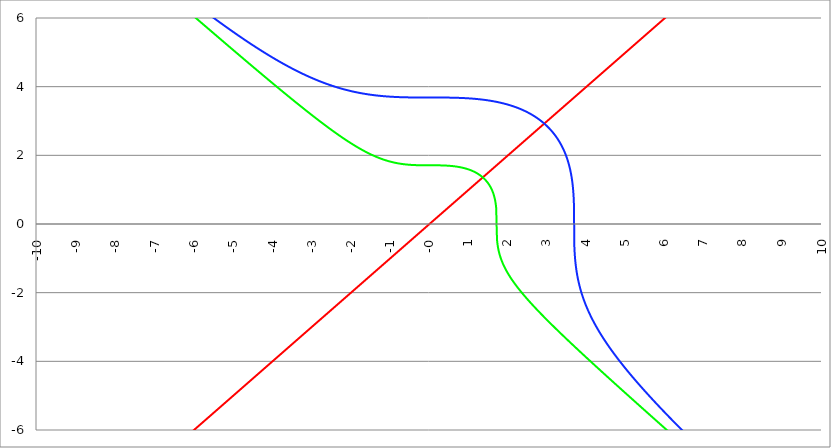
| Category | Series 1 | Series 0 | Series 2 |
|---|---|---|---|
| -10.0 | -10 | 10.017 | 10.164 |
| -9.99 | -9.99 | 10.007 | 10.154 |
| -9.98 | -9.98 | 9.997 | 10.145 |
| -9.97 | -9.97 | 9.987 | 10.135 |
| -9.96 | -9.96 | 9.977 | 10.125 |
| -9.95 | -9.95 | 9.967 | 10.116 |
| -9.940000000000001 | -9.94 | 9.957 | 10.106 |
| -9.930000000000001 | -9.93 | 9.947 | 10.096 |
| -9.920000000000002 | -9.92 | 9.937 | 10.087 |
| -9.91 | -9.91 | 9.927 | 10.077 |
| -9.900000000000002 | -9.9 | 9.917 | 10.067 |
| -9.890000000000002 | -9.89 | 9.907 | 10.058 |
| -9.880000000000003 | -9.88 | 9.897 | 10.048 |
| -9.870000000000003 | -9.87 | 9.887 | 10.038 |
| -9.860000000000001 | -9.86 | 9.877 | 10.029 |
| -9.850000000000003 | -9.85 | 9.867 | 10.019 |
| -9.840000000000003 | -9.84 | 9.857 | 10.009 |
| -9.830000000000004 | -9.83 | 9.847 | 10 |
| -9.820000000000004 | -9.82 | 9.837 | 9.99 |
| -9.810000000000004 | -9.81 | 9.827 | 9.98 |
| -9.800000000000004 | -9.8 | 9.817 | 9.971 |
| -9.790000000000004 | -9.79 | 9.807 | 9.961 |
| -9.780000000000005 | -9.78 | 9.797 | 9.951 |
| -9.770000000000005 | -9.77 | 9.787 | 9.942 |
| -9.760000000000005 | -9.76 | 9.777 | 9.932 |
| -9.750000000000005 | -9.75 | 9.768 | 9.922 |
| -9.740000000000006 | -9.74 | 9.758 | 9.913 |
| -9.730000000000006 | -9.73 | 9.748 | 9.903 |
| -9.720000000000006 | -9.72 | 9.738 | 9.893 |
| -9.710000000000006 | -9.71 | 9.728 | 9.884 |
| -9.700000000000006 | -9.7 | 9.718 | 9.874 |
| -9.690000000000007 | -9.69 | 9.708 | 9.864 |
| -9.680000000000007 | -9.68 | 9.698 | 9.855 |
| -9.670000000000007 | -9.67 | 9.688 | 9.845 |
| -9.660000000000007 | -9.66 | 9.678 | 9.835 |
| -9.650000000000007 | -9.65 | 9.668 | 9.826 |
| -9.640000000000008 | -9.64 | 9.658 | 9.816 |
| -9.630000000000008 | -9.63 | 9.648 | 9.806 |
| -9.620000000000008 | -9.62 | 9.638 | 9.797 |
| -9.610000000000008 | -9.61 | 9.628 | 9.787 |
| -9.600000000000009 | -9.6 | 9.618 | 9.778 |
| -9.590000000000009 | -9.59 | 9.608 | 9.768 |
| -9.580000000000007 | -9.58 | 9.598 | 9.758 |
| -9.57000000000001 | -9.57 | 9.588 | 9.749 |
| -9.56000000000001 | -9.56 | 9.578 | 9.739 |
| -9.55000000000001 | -9.55 | 9.568 | 9.729 |
| -9.54000000000001 | -9.54 | 9.558 | 9.72 |
| -9.53000000000001 | -9.53 | 9.548 | 9.71 |
| -9.52000000000001 | -9.52 | 9.538 | 9.7 |
| -9.51000000000001 | -9.51 | 9.528 | 9.691 |
| -9.50000000000001 | -9.5 | 9.518 | 9.681 |
| -9.49000000000001 | -9.49 | 9.508 | 9.672 |
| -9.48000000000001 | -9.48 | 9.499 | 9.662 |
| -9.47000000000001 | -9.47 | 9.489 | 9.652 |
| -9.46000000000001 | -9.46 | 9.479 | 9.643 |
| -9.45000000000001 | -9.45 | 9.469 | 9.633 |
| -9.44000000000001 | -9.44 | 9.459 | 9.623 |
| -9.430000000000012 | -9.43 | 9.449 | 9.614 |
| -9.420000000000012 | -9.42 | 9.439 | 9.604 |
| -9.410000000000013 | -9.41 | 9.429 | 9.595 |
| -9.400000000000013 | -9.4 | 9.419 | 9.585 |
| -9.390000000000011 | -9.39 | 9.409 | 9.575 |
| -9.380000000000013 | -9.38 | 9.399 | 9.566 |
| -9.370000000000013 | -9.37 | 9.389 | 9.556 |
| -9.360000000000014 | -9.36 | 9.379 | 9.546 |
| -9.350000000000014 | -9.35 | 9.369 | 9.537 |
| -9.340000000000014 | -9.34 | 9.359 | 9.527 |
| -9.330000000000014 | -9.33 | 9.349 | 9.518 |
| -9.320000000000014 | -9.32 | 9.339 | 9.508 |
| -9.310000000000015 | -9.31 | 9.329 | 9.498 |
| -9.300000000000013 | -9.3 | 9.319 | 9.489 |
| -9.290000000000015 | -9.29 | 9.309 | 9.479 |
| -9.280000000000015 | -9.28 | 9.299 | 9.47 |
| -9.270000000000016 | -9.27 | 9.289 | 9.46 |
| -9.260000000000016 | -9.26 | 9.279 | 9.45 |
| -9.250000000000014 | -9.25 | 9.269 | 9.441 |
| -9.240000000000016 | -9.24 | 9.259 | 9.431 |
| -9.230000000000016 | -9.23 | 9.25 | 9.422 |
| -9.220000000000017 | -9.22 | 9.24 | 9.412 |
| -9.210000000000017 | -9.21 | 9.23 | 9.402 |
| -9.200000000000017 | -9.2 | 9.22 | 9.393 |
| -9.190000000000017 | -9.19 | 9.21 | 9.383 |
| -9.180000000000017 | -9.18 | 9.2 | 9.374 |
| -9.170000000000018 | -9.17 | 9.19 | 9.364 |
| -9.160000000000016 | -9.16 | 9.18 | 9.354 |
| -9.150000000000018 | -9.15 | 9.17 | 9.345 |
| -9.140000000000018 | -9.14 | 9.16 | 9.335 |
| -9.130000000000019 | -9.13 | 9.15 | 9.326 |
| -9.120000000000019 | -9.12 | 9.14 | 9.316 |
| -9.110000000000017 | -9.11 | 9.13 | 9.307 |
| -9.10000000000002 | -9.1 | 9.12 | 9.297 |
| -9.09000000000002 | -9.09 | 9.11 | 9.287 |
| -9.08000000000002 | -9.08 | 9.1 | 9.278 |
| -9.07000000000002 | -9.07 | 9.09 | 9.268 |
| -9.06000000000002 | -9.06 | 9.08 | 9.259 |
| -9.05000000000002 | -9.05 | 9.07 | 9.249 |
| -9.04000000000002 | -9.04 | 9.06 | 9.24 |
| -9.03000000000002 | -9.03 | 9.05 | 9.23 |
| -9.020000000000021 | -9.02 | 9.04 | 9.22 |
| -9.010000000000021 | -9.01 | 9.03 | 9.211 |
| -9.000000000000021 | -9 | 9.021 | 9.201 |
| -8.990000000000022 | -8.99 | 9.011 | 9.192 |
| -8.980000000000022 | -8.98 | 9.001 | 9.182 |
| -8.97000000000002 | -8.97 | 8.991 | 9.173 |
| -8.960000000000022 | -8.96 | 8.981 | 9.163 |
| -8.950000000000022 | -8.95 | 8.971 | 9.153 |
| -8.940000000000023 | -8.94 | 8.961 | 9.144 |
| -8.930000000000023 | -8.93 | 8.951 | 9.134 |
| -8.920000000000023 | -8.92 | 8.941 | 9.125 |
| -8.910000000000023 | -8.91 | 8.931 | 9.115 |
| -8.900000000000023 | -8.9 | 8.921 | 9.106 |
| -8.890000000000024 | -8.89 | 8.911 | 9.096 |
| -8.880000000000024 | -8.88 | 8.901 | 9.087 |
| -8.870000000000024 | -8.87 | 8.891 | 9.077 |
| -8.860000000000024 | -8.86 | 8.881 | 9.067 |
| -8.850000000000025 | -8.85 | 8.871 | 9.058 |
| -8.840000000000025 | -8.84 | 8.861 | 9.048 |
| -8.830000000000025 | -8.83 | 8.851 | 9.039 |
| -8.820000000000025 | -8.82 | 8.841 | 9.029 |
| -8.810000000000025 | -8.81 | 8.831 | 9.02 |
| -8.800000000000026 | -8.8 | 8.821 | 9.01 |
| -8.790000000000026 | -8.79 | 8.812 | 9.001 |
| -8.780000000000026 | -8.78 | 8.802 | 8.991 |
| -8.770000000000026 | -8.77 | 8.792 | 8.982 |
| -8.760000000000026 | -8.76 | 8.782 | 8.972 |
| -8.750000000000027 | -8.75 | 8.772 | 8.962 |
| -8.740000000000027 | -8.74 | 8.762 | 8.953 |
| -8.730000000000027 | -8.73 | 8.752 | 8.943 |
| -8.720000000000027 | -8.72 | 8.742 | 8.934 |
| -8.710000000000027 | -8.71 | 8.732 | 8.924 |
| -8.700000000000028 | -8.7 | 8.722 | 8.915 |
| -8.690000000000028 | -8.69 | 8.712 | 8.905 |
| -8.680000000000028 | -8.68 | 8.702 | 8.896 |
| -8.670000000000028 | -8.67 | 8.692 | 8.886 |
| -8.660000000000029 | -8.66 | 8.682 | 8.877 |
| -8.650000000000029 | -8.65 | 8.672 | 8.867 |
| -8.640000000000029 | -8.64 | 8.662 | 8.858 |
| -8.63000000000003 | -8.63 | 8.652 | 8.848 |
| -8.62000000000003 | -8.62 | 8.642 | 8.839 |
| -8.61000000000003 | -8.61 | 8.632 | 8.829 |
| -8.60000000000003 | -8.6 | 8.622 | 8.82 |
| -8.59000000000003 | -8.59 | 8.613 | 8.81 |
| -8.58000000000003 | -8.58 | 8.603 | 8.801 |
| -8.57000000000003 | -8.57 | 8.593 | 8.791 |
| -8.56000000000003 | -8.56 | 8.583 | 8.782 |
| -8.55000000000003 | -8.55 | 8.573 | 8.772 |
| -8.540000000000031 | -8.54 | 8.563 | 8.763 |
| -8.530000000000031 | -8.53 | 8.553 | 8.753 |
| -8.520000000000032 | -8.52 | 8.543 | 8.744 |
| -8.510000000000032 | -8.51 | 8.533 | 8.734 |
| -8.50000000000003 | -8.5 | 8.523 | 8.725 |
| -8.490000000000032 | -8.49 | 8.513 | 8.715 |
| -8.480000000000032 | -8.48 | 8.503 | 8.706 |
| -8.470000000000033 | -8.47 | 8.493 | 8.696 |
| -8.460000000000033 | -8.46 | 8.483 | 8.687 |
| -8.450000000000033 | -8.45 | 8.473 | 8.677 |
| -8.440000000000033 | -8.44 | 8.463 | 8.668 |
| -8.430000000000033 | -8.43 | 8.453 | 8.658 |
| -8.420000000000034 | -8.42 | 8.443 | 8.649 |
| -8.410000000000032 | -8.41 | 8.433 | 8.639 |
| -8.400000000000034 | -8.4 | 8.424 | 8.63 |
| -8.390000000000034 | -8.39 | 8.414 | 8.62 |
| -8.380000000000035 | -8.38 | 8.404 | 8.611 |
| -8.370000000000035 | -8.37 | 8.394 | 8.601 |
| -8.360000000000033 | -8.36 | 8.384 | 8.592 |
| -8.350000000000035 | -8.35 | 8.374 | 8.583 |
| -8.340000000000035 | -8.34 | 8.364 | 8.573 |
| -8.330000000000036 | -8.33 | 8.354 | 8.564 |
| -8.320000000000036 | -8.32 | 8.344 | 8.554 |
| -8.310000000000034 | -8.31 | 8.334 | 8.545 |
| -8.300000000000036 | -8.3 | 8.324 | 8.535 |
| -8.290000000000036 | -8.29 | 8.314 | 8.526 |
| -8.280000000000037 | -8.28 | 8.304 | 8.516 |
| -8.270000000000037 | -8.27 | 8.294 | 8.507 |
| -8.260000000000037 | -8.26 | 8.284 | 8.497 |
| -8.250000000000037 | -8.25 | 8.274 | 8.488 |
| -8.240000000000038 | -8.24 | 8.264 | 8.478 |
| -8.230000000000038 | -8.23 | 8.255 | 8.469 |
| -8.220000000000038 | -8.22 | 8.245 | 8.46 |
| -8.210000000000038 | -8.21 | 8.235 | 8.45 |
| -8.200000000000038 | -8.2 | 8.225 | 8.441 |
| -8.190000000000039 | -8.19 | 8.215 | 8.431 |
| -8.180000000000039 | -8.18 | 8.205 | 8.422 |
| -8.170000000000037 | -8.17 | 8.195 | 8.412 |
| -8.16000000000004 | -8.16 | 8.185 | 8.403 |
| -8.15000000000004 | -8.15 | 8.175 | 8.394 |
| -8.14000000000004 | -8.14 | 8.165 | 8.384 |
| -8.13000000000004 | -8.13 | 8.155 | 8.375 |
| -8.12000000000004 | -8.12 | 8.145 | 8.365 |
| -8.11000000000004 | -8.11 | 8.135 | 8.356 |
| -8.10000000000004 | -8.1 | 8.125 | 8.346 |
| -8.09000000000004 | -8.09 | 8.115 | 8.337 |
| -8.08000000000004 | -8.08 | 8.105 | 8.328 |
| -8.07000000000004 | -8.07 | 8.096 | 8.318 |
| -8.06000000000004 | -8.06 | 8.086 | 8.309 |
| -8.05000000000004 | -8.05 | 8.076 | 8.299 |
| -8.040000000000042 | -8.04 | 8.066 | 8.29 |
| -8.03000000000004 | -8.03 | 8.056 | 8.281 |
| -8.020000000000042 | -8.02 | 8.046 | 8.271 |
| -8.010000000000042 | -8.01 | 8.036 | 8.262 |
| -8.000000000000043 | -8 | 8.026 | 8.252 |
| -7.990000000000043 | -7.99 | 8.016 | 8.243 |
| -7.980000000000043 | -7.98 | 8.006 | 8.234 |
| -7.970000000000043 | -7.97 | 7.996 | 8.224 |
| -7.960000000000043 | -7.96 | 7.986 | 8.215 |
| -7.950000000000044 | -7.95 | 7.976 | 8.205 |
| -7.940000000000044 | -7.94 | 7.966 | 8.196 |
| -7.930000000000044 | -7.93 | 7.956 | 8.187 |
| -7.920000000000044 | -7.92 | 7.946 | 8.177 |
| -7.910000000000044 | -7.91 | 7.937 | 8.168 |
| -7.900000000000044 | -7.9 | 7.927 | 8.159 |
| -7.890000000000045 | -7.89 | 7.917 | 8.149 |
| -7.880000000000045 | -7.88 | 7.907 | 8.14 |
| -7.870000000000045 | -7.87 | 7.897 | 8.13 |
| -7.860000000000046 | -7.86 | 7.887 | 8.121 |
| -7.850000000000046 | -7.85 | 7.877 | 8.112 |
| -7.840000000000046 | -7.84 | 7.867 | 8.102 |
| -7.830000000000046 | -7.83 | 7.857 | 8.093 |
| -7.820000000000046 | -7.82 | 7.847 | 8.084 |
| -7.810000000000047 | -7.81 | 7.837 | 8.074 |
| -7.800000000000047 | -7.8 | 7.827 | 8.065 |
| -7.790000000000047 | -7.79 | 7.817 | 8.055 |
| -7.780000000000047 | -7.78 | 7.807 | 8.046 |
| -7.770000000000047 | -7.77 | 7.798 | 8.037 |
| -7.760000000000048 | -7.76 | 7.788 | 8.027 |
| -7.750000000000048 | -7.75 | 7.778 | 8.018 |
| -7.740000000000048 | -7.74 | 7.768 | 8.009 |
| -7.730000000000048 | -7.73 | 7.758 | 7.999 |
| -7.720000000000049 | -7.72 | 7.748 | 7.99 |
| -7.710000000000049 | -7.71 | 7.738 | 7.981 |
| -7.700000000000049 | -7.7 | 7.728 | 7.971 |
| -7.690000000000049 | -7.69 | 7.718 | 7.962 |
| -7.680000000000049 | -7.68 | 7.708 | 7.953 |
| -7.67000000000005 | -7.67 | 7.698 | 7.943 |
| -7.66000000000005 | -7.66 | 7.688 | 7.934 |
| -7.65000000000005 | -7.65 | 7.678 | 7.925 |
| -7.64000000000005 | -7.64 | 7.668 | 7.915 |
| -7.63000000000005 | -7.63 | 7.659 | 7.906 |
| -7.620000000000051 | -7.62 | 7.649 | 7.897 |
| -7.610000000000051 | -7.61 | 7.639 | 7.888 |
| -7.600000000000051 | -7.6 | 7.629 | 7.878 |
| -7.590000000000051 | -7.59 | 7.619 | 7.869 |
| -7.580000000000052 | -7.58 | 7.609 | 7.86 |
| -7.570000000000052 | -7.57 | 7.599 | 7.85 |
| -7.560000000000052 | -7.56 | 7.589 | 7.841 |
| -7.550000000000052 | -7.55 | 7.579 | 7.832 |
| -7.540000000000052 | -7.54 | 7.569 | 7.822 |
| -7.530000000000053 | -7.53 | 7.559 | 7.813 |
| -7.520000000000053 | -7.52 | 7.549 | 7.804 |
| -7.510000000000053 | -7.51 | 7.539 | 7.795 |
| -7.500000000000053 | -7.5 | 7.53 | 7.785 |
| -7.490000000000053 | -7.49 | 7.52 | 7.776 |
| -7.480000000000054 | -7.48 | 7.51 | 7.767 |
| -7.470000000000054 | -7.47 | 7.5 | 7.757 |
| -7.460000000000054 | -7.46 | 7.49 | 7.748 |
| -7.450000000000054 | -7.45 | 7.48 | 7.739 |
| -7.440000000000054 | -7.44 | 7.47 | 7.73 |
| -7.430000000000054 | -7.43 | 7.46 | 7.72 |
| -7.420000000000055 | -7.42 | 7.45 | 7.711 |
| -7.410000000000055 | -7.41 | 7.44 | 7.702 |
| -7.400000000000055 | -7.4 | 7.43 | 7.693 |
| -7.390000000000056 | -7.39 | 7.42 | 7.683 |
| -7.380000000000056 | -7.38 | 7.41 | 7.674 |
| -7.370000000000056 | -7.37 | 7.401 | 7.665 |
| -7.360000000000056 | -7.36 | 7.391 | 7.656 |
| -7.350000000000056 | -7.35 | 7.381 | 7.646 |
| -7.340000000000057 | -7.34 | 7.371 | 7.637 |
| -7.330000000000057 | -7.33 | 7.361 | 7.628 |
| -7.320000000000057 | -7.32 | 7.351 | 7.619 |
| -7.310000000000057 | -7.31 | 7.341 | 7.609 |
| -7.300000000000058 | -7.3 | 7.331 | 7.6 |
| -7.290000000000058 | -7.29 | 7.321 | 7.591 |
| -7.280000000000058 | -7.28 | 7.311 | 7.582 |
| -7.270000000000058 | -7.27 | 7.301 | 7.573 |
| -7.260000000000058 | -7.26 | 7.291 | 7.563 |
| -7.250000000000059 | -7.25 | 7.282 | 7.554 |
| -7.240000000000059 | -7.24 | 7.272 | 7.545 |
| -7.23000000000006 | -7.23 | 7.262 | 7.536 |
| -7.220000000000059 | -7.22 | 7.252 | 7.527 |
| -7.210000000000059 | -7.21 | 7.242 | 7.517 |
| -7.20000000000006 | -7.2 | 7.232 | 7.508 |
| -7.19000000000006 | -7.19 | 7.222 | 7.499 |
| -7.18000000000006 | -7.18 | 7.212 | 7.49 |
| -7.17000000000006 | -7.17 | 7.202 | 7.481 |
| -7.160000000000061 | -7.16 | 7.192 | 7.471 |
| -7.150000000000061 | -7.15 | 7.182 | 7.462 |
| -7.140000000000061 | -7.14 | 7.173 | 7.453 |
| -7.130000000000061 | -7.13 | 7.163 | 7.444 |
| -7.120000000000061 | -7.12 | 7.153 | 7.435 |
| -7.110000000000062 | -7.11 | 7.143 | 7.425 |
| -7.100000000000062 | -7.1 | 7.133 | 7.416 |
| -7.090000000000062 | -7.09 | 7.123 | 7.407 |
| -7.080000000000062 | -7.08 | 7.113 | 7.398 |
| -7.070000000000062 | -7.07 | 7.103 | 7.389 |
| -7.060000000000063 | -7.06 | 7.093 | 7.38 |
| -7.050000000000063 | -7.05 | 7.083 | 7.371 |
| -7.040000000000063 | -7.04 | 7.073 | 7.361 |
| -7.030000000000063 | -7.03 | 7.064 | 7.352 |
| -7.020000000000064 | -7.02 | 7.054 | 7.343 |
| -7.010000000000064 | -7.01 | 7.044 | 7.334 |
| -7.000000000000064 | -7 | 7.034 | 7.325 |
| -6.990000000000064 | -6.99 | 7.024 | 7.316 |
| -6.980000000000064 | -6.98 | 7.014 | 7.307 |
| -6.970000000000064 | -6.97 | 7.004 | 7.297 |
| -6.960000000000064 | -6.96 | 6.994 | 7.288 |
| -6.950000000000064 | -6.95 | 6.984 | 7.279 |
| -6.940000000000065 | -6.94 | 6.974 | 7.27 |
| -6.930000000000065 | -6.93 | 6.965 | 7.261 |
| -6.920000000000065 | -6.92 | 6.955 | 7.252 |
| -6.910000000000065 | -6.91 | 6.945 | 7.243 |
| -6.900000000000066 | -6.9 | 6.935 | 7.234 |
| -6.890000000000066 | -6.89 | 6.925 | 7.225 |
| -6.880000000000066 | -6.88 | 6.915 | 7.215 |
| -6.870000000000066 | -6.87 | 6.905 | 7.206 |
| -6.860000000000067 | -6.86 | 6.895 | 7.197 |
| -6.850000000000067 | -6.85 | 6.885 | 7.188 |
| -6.840000000000067 | -6.84 | 6.875 | 7.179 |
| -6.830000000000067 | -6.83 | 6.866 | 7.17 |
| -6.820000000000068 | -6.82 | 6.856 | 7.161 |
| -6.810000000000068 | -6.81 | 6.846 | 7.152 |
| -6.800000000000068 | -6.8 | 6.836 | 7.143 |
| -6.790000000000068 | -6.79 | 6.826 | 7.134 |
| -6.780000000000068 | -6.78 | 6.816 | 7.125 |
| -6.770000000000068 | -6.77 | 6.806 | 7.116 |
| -6.760000000000069 | -6.76 | 6.796 | 7.107 |
| -6.75000000000007 | -6.75 | 6.786 | 7.098 |
| -6.74000000000007 | -6.74 | 6.776 | 7.089 |
| -6.73000000000007 | -6.73 | 6.767 | 7.08 |
| -6.72000000000007 | -6.72 | 6.757 | 7.07 |
| -6.71000000000007 | -6.71 | 6.747 | 7.061 |
| -6.70000000000007 | -6.7 | 6.737 | 7.052 |
| -6.69000000000007 | -6.69 | 6.727 | 7.043 |
| -6.680000000000071 | -6.68 | 6.717 | 7.034 |
| -6.670000000000071 | -6.67 | 6.707 | 7.025 |
| -6.660000000000071 | -6.66 | 6.697 | 7.016 |
| -6.650000000000071 | -6.65 | 6.687 | 7.007 |
| -6.640000000000072 | -6.64 | 6.678 | 6.998 |
| -6.630000000000072 | -6.63 | 6.668 | 6.989 |
| -6.620000000000072 | -6.62 | 6.658 | 6.98 |
| -6.610000000000072 | -6.61 | 6.648 | 6.971 |
| -6.600000000000072 | -6.6 | 6.638 | 6.962 |
| -6.590000000000073 | -6.59 | 6.628 | 6.953 |
| -6.580000000000073 | -6.58 | 6.618 | 6.944 |
| -6.570000000000073 | -6.57 | 6.608 | 6.935 |
| -6.560000000000073 | -6.56 | 6.599 | 6.926 |
| -6.550000000000074 | -6.55 | 6.589 | 6.917 |
| -6.540000000000074 | -6.54 | 6.579 | 6.909 |
| -6.530000000000074 | -6.53 | 6.569 | 6.9 |
| -6.520000000000074 | -6.52 | 6.559 | 6.891 |
| -6.510000000000074 | -6.51 | 6.549 | 6.882 |
| -6.500000000000074 | -6.5 | 6.539 | 6.873 |
| -6.490000000000074 | -6.49 | 6.529 | 6.864 |
| -6.480000000000074 | -6.48 | 6.519 | 6.855 |
| -6.470000000000075 | -6.47 | 6.51 | 6.846 |
| -6.460000000000075 | -6.46 | 6.5 | 6.837 |
| -6.450000000000075 | -6.45 | 6.49 | 6.828 |
| -6.440000000000075 | -6.44 | 6.48 | 6.819 |
| -6.430000000000076 | -6.43 | 6.47 | 6.81 |
| -6.420000000000076 | -6.42 | 6.46 | 6.801 |
| -6.410000000000076 | -6.41 | 6.45 | 6.792 |
| -6.400000000000076 | -6.4 | 6.44 | 6.783 |
| -6.390000000000077 | -6.39 | 6.431 | 6.775 |
| -6.380000000000077 | -6.38 | 6.421 | 6.766 |
| -6.370000000000077 | -6.37 | 6.411 | 6.757 |
| -6.360000000000078 | -6.36 | 6.401 | 6.748 |
| -6.350000000000078 | -6.35 | 6.391 | 6.739 |
| -6.340000000000078 | -6.34 | 6.381 | 6.73 |
| -6.330000000000078 | -6.33 | 6.371 | 6.721 |
| -6.320000000000078 | -6.32 | 6.361 | 6.712 |
| -6.310000000000079 | -6.31 | 6.352 | 6.704 |
| -6.300000000000079 | -6.3 | 6.342 | 6.695 |
| -6.29000000000008 | -6.29 | 6.332 | 6.686 |
| -6.28000000000008 | -6.28 | 6.322 | 6.677 |
| -6.27000000000008 | -6.27 | 6.312 | 6.668 |
| -6.26000000000008 | -6.26 | 6.302 | 6.659 |
| -6.25000000000008 | -6.25 | 6.292 | 6.65 |
| -6.24000000000008 | -6.24 | 6.283 | 6.642 |
| -6.23000000000008 | -6.23 | 6.273 | 6.633 |
| -6.220000000000081 | -6.22 | 6.263 | 6.624 |
| -6.210000000000081 | -6.21 | 6.253 | 6.615 |
| -6.200000000000081 | -6.2 | 6.243 | 6.606 |
| -6.190000000000081 | -6.19 | 6.233 | 6.598 |
| -6.180000000000081 | -6.18 | 6.223 | 6.589 |
| -6.170000000000082 | -6.17 | 6.213 | 6.58 |
| -6.160000000000082 | -6.16 | 6.204 | 6.571 |
| -6.150000000000082 | -6.15 | 6.194 | 6.562 |
| -6.140000000000082 | -6.14 | 6.184 | 6.554 |
| -6.130000000000082 | -6.13 | 6.174 | 6.545 |
| -6.120000000000083 | -6.12 | 6.164 | 6.536 |
| -6.110000000000083 | -6.11 | 6.154 | 6.527 |
| -6.100000000000083 | -6.1 | 6.144 | 6.519 |
| -6.090000000000083 | -6.09 | 6.135 | 6.51 |
| -6.080000000000084 | -6.08 | 6.125 | 6.501 |
| -6.070000000000084 | -6.07 | 6.115 | 6.492 |
| -6.060000000000084 | -6.06 | 6.105 | 6.484 |
| -6.050000000000084 | -6.05 | 6.095 | 6.475 |
| -6.040000000000084 | -6.04 | 6.085 | 6.466 |
| -6.030000000000084 | -6.03 | 6.075 | 6.457 |
| -6.020000000000085 | -6.02 | 6.066 | 6.449 |
| -6.010000000000085 | -6.01 | 6.056 | 6.44 |
| -6.000000000000085 | -6 | 6.046 | 6.431 |
| -5.990000000000085 | -5.99 | 6.036 | 6.423 |
| -5.980000000000085 | -5.98 | 6.026 | 6.414 |
| -5.970000000000085 | -5.97 | 6.016 | 6.405 |
| -5.960000000000086 | -5.96 | 6.007 | 6.396 |
| -5.950000000000086 | -5.95 | 5.997 | 6.388 |
| -5.940000000000086 | -5.94 | 5.987 | 6.379 |
| -5.930000000000086 | -5.93 | 5.977 | 6.37 |
| -5.920000000000087 | -5.92 | 5.967 | 6.362 |
| -5.910000000000087 | -5.91 | 5.957 | 6.353 |
| -5.900000000000087 | -5.9 | 5.947 | 6.344 |
| -5.890000000000088 | -5.89 | 5.938 | 6.336 |
| -5.880000000000088 | -5.88 | 5.928 | 6.327 |
| -5.870000000000088 | -5.87 | 5.918 | 6.319 |
| -5.860000000000088 | -5.86 | 5.908 | 6.31 |
| -5.850000000000088 | -5.85 | 5.898 | 6.301 |
| -5.840000000000089 | -5.84 | 5.888 | 6.293 |
| -5.830000000000089 | -5.83 | 5.879 | 6.284 |
| -5.820000000000089 | -5.82 | 5.869 | 6.275 |
| -5.810000000000089 | -5.81 | 5.859 | 6.267 |
| -5.800000000000089 | -5.8 | 5.849 | 6.258 |
| -5.79000000000009 | -5.79 | 5.839 | 6.25 |
| -5.78000000000009 | -5.78 | 5.829 | 6.241 |
| -5.77000000000009 | -5.77 | 5.82 | 6.233 |
| -5.76000000000009 | -5.76 | 5.81 | 6.224 |
| -5.750000000000091 | -5.75 | 5.8 | 6.215 |
| -5.740000000000091 | -5.74 | 5.79 | 6.207 |
| -5.730000000000091 | -5.73 | 5.78 | 6.198 |
| -5.720000000000091 | -5.72 | 5.77 | 6.19 |
| -5.710000000000091 | -5.71 | 5.761 | 6.181 |
| -5.700000000000092 | -5.7 | 5.751 | 6.173 |
| -5.690000000000092 | -5.69 | 5.741 | 6.164 |
| -5.680000000000092 | -5.68 | 5.731 | 6.156 |
| -5.670000000000092 | -5.67 | 5.721 | 6.147 |
| -5.660000000000092 | -5.66 | 5.712 | 6.139 |
| -5.650000000000093 | -5.65 | 5.702 | 6.13 |
| -5.640000000000093 | -5.64 | 5.692 | 6.122 |
| -5.630000000000093 | -5.63 | 5.682 | 6.113 |
| -5.620000000000093 | -5.62 | 5.672 | 6.105 |
| -5.610000000000093 | -5.61 | 5.662 | 6.096 |
| -5.600000000000094 | -5.6 | 5.653 | 6.088 |
| -5.590000000000094 | -5.59 | 5.643 | 6.079 |
| -5.580000000000094 | -5.58 | 5.633 | 6.071 |
| -5.570000000000094 | -5.57 | 5.623 | 6.062 |
| -5.560000000000095 | -5.56 | 5.613 | 6.054 |
| -5.550000000000095 | -5.55 | 5.604 | 6.046 |
| -5.540000000000095 | -5.54 | 5.594 | 6.037 |
| -5.530000000000095 | -5.53 | 5.584 | 6.029 |
| -5.520000000000095 | -5.52 | 5.574 | 6.02 |
| -5.510000000000096 | -5.51 | 5.564 | 6.012 |
| -5.500000000000096 | -5.5 | 5.555 | 6.003 |
| -5.490000000000096 | -5.49 | 5.545 | 5.995 |
| -5.480000000000096 | -5.48 | 5.535 | 5.987 |
| -5.470000000000096 | -5.47 | 5.525 | 5.978 |
| -5.460000000000097 | -5.46 | 5.515 | 5.97 |
| -5.450000000000097 | -5.45 | 5.506 | 5.962 |
| -5.440000000000097 | -5.44 | 5.496 | 5.953 |
| -5.430000000000097 | -5.43 | 5.486 | 5.945 |
| -5.420000000000098 | -5.42 | 5.476 | 5.937 |
| -5.410000000000098 | -5.41 | 5.466 | 5.928 |
| -5.400000000000098 | -5.4 | 5.457 | 5.92 |
| -5.390000000000098 | -5.39 | 5.447 | 5.912 |
| -5.380000000000098 | -5.38 | 5.437 | 5.903 |
| -5.370000000000099 | -5.37 | 5.427 | 5.895 |
| -5.360000000000099 | -5.36 | 5.417 | 5.887 |
| -5.350000000000099 | -5.35 | 5.408 | 5.878 |
| -5.340000000000099 | -5.34 | 5.398 | 5.87 |
| -5.330000000000099 | -5.33 | 5.388 | 5.862 |
| -5.3200000000001 | -5.32 | 5.378 | 5.854 |
| -5.3100000000001 | -5.31 | 5.368 | 5.845 |
| -5.3000000000001 | -5.3 | 5.359 | 5.837 |
| -5.2900000000001 | -5.29 | 5.349 | 5.829 |
| -5.2800000000001 | -5.28 | 5.339 | 5.821 |
| -5.2700000000001 | -5.27 | 5.329 | 5.812 |
| -5.260000000000101 | -5.26 | 5.32 | 5.804 |
| -5.250000000000101 | -5.25 | 5.31 | 5.796 |
| -5.240000000000101 | -5.24 | 5.3 | 5.788 |
| -5.230000000000101 | -5.23 | 5.29 | 5.78 |
| -5.220000000000102 | -5.22 | 5.28 | 5.771 |
| -5.210000000000102 | -5.21 | 5.271 | 5.763 |
| -5.200000000000102 | -5.2 | 5.261 | 5.755 |
| -5.190000000000103 | -5.19 | 5.251 | 5.747 |
| -5.180000000000103 | -5.18 | 5.241 | 5.739 |
| -5.170000000000103 | -5.17 | 5.232 | 5.731 |
| -5.160000000000103 | -5.16 | 5.222 | 5.722 |
| -5.150000000000103 | -5.15 | 5.212 | 5.714 |
| -5.140000000000104 | -5.14 | 5.202 | 5.706 |
| -5.130000000000104 | -5.13 | 5.193 | 5.698 |
| -5.120000000000104 | -5.12 | 5.183 | 5.69 |
| -5.110000000000104 | -5.11 | 5.173 | 5.682 |
| -5.100000000000104 | -5.1 | 5.163 | 5.674 |
| -5.090000000000104 | -5.09 | 5.154 | 5.666 |
| -5.080000000000104 | -5.08 | 5.144 | 5.658 |
| -5.070000000000105 | -5.07 | 5.134 | 5.65 |
| -5.060000000000105 | -5.06 | 5.124 | 5.642 |
| -5.050000000000105 | -5.05 | 5.115 | 5.634 |
| -5.040000000000105 | -5.04 | 5.105 | 5.625 |
| -5.030000000000105 | -5.03 | 5.095 | 5.617 |
| -5.020000000000106 | -5.02 | 5.085 | 5.609 |
| -5.010000000000106 | -5.01 | 5.076 | 5.601 |
| -5.000000000000106 | -5 | 5.066 | 5.593 |
| -4.990000000000106 | -4.99 | 5.056 | 5.585 |
| -4.980000000000106 | -4.98 | 5.046 | 5.577 |
| -4.970000000000107 | -4.97 | 5.037 | 5.57 |
| -4.960000000000107 | -4.96 | 5.027 | 5.562 |
| -4.950000000000107 | -4.95 | 5.017 | 5.554 |
| -4.940000000000107 | -4.94 | 5.007 | 5.546 |
| -4.930000000000108 | -4.93 | 4.998 | 5.538 |
| -4.920000000000108 | -4.92 | 4.988 | 5.53 |
| -4.910000000000108 | -4.91 | 4.978 | 5.522 |
| -4.900000000000108 | -4.9 | 4.968 | 5.514 |
| -4.890000000000109 | -4.89 | 4.959 | 5.506 |
| -4.88000000000011 | -4.88 | 4.949 | 5.498 |
| -4.87000000000011 | -4.87 | 4.939 | 5.49 |
| -4.86000000000011 | -4.86 | 4.93 | 5.482 |
| -4.85000000000011 | -4.85 | 4.92 | 5.475 |
| -4.84000000000011 | -4.84 | 4.91 | 5.467 |
| -4.83000000000011 | -4.83 | 4.9 | 5.459 |
| -4.82000000000011 | -4.82 | 4.891 | 5.451 |
| -4.810000000000111 | -4.81 | 4.881 | 5.443 |
| -4.800000000000111 | -4.8 | 4.871 | 5.436 |
| -4.790000000000111 | -4.79 | 4.862 | 5.428 |
| -4.780000000000111 | -4.78 | 4.852 | 5.42 |
| -4.770000000000111 | -4.77 | 4.842 | 5.412 |
| -4.760000000000112 | -4.76 | 4.832 | 5.404 |
| -4.750000000000112 | -4.75 | 4.823 | 5.397 |
| -4.740000000000112 | -4.74 | 4.813 | 5.389 |
| -4.730000000000112 | -4.73 | 4.803 | 5.381 |
| -4.720000000000112 | -4.72 | 4.794 | 5.373 |
| -4.710000000000113 | -4.71 | 4.784 | 5.366 |
| -4.700000000000113 | -4.7 | 4.774 | 5.358 |
| -4.690000000000113 | -4.69 | 4.765 | 5.35 |
| -4.680000000000113 | -4.68 | 4.755 | 5.343 |
| -4.670000000000114 | -4.67 | 4.745 | 5.335 |
| -4.660000000000114 | -4.66 | 4.736 | 5.327 |
| -4.650000000000114 | -4.65 | 4.726 | 5.32 |
| -4.640000000000114 | -4.64 | 4.716 | 5.312 |
| -4.630000000000114 | -4.63 | 4.706 | 5.304 |
| -4.620000000000115 | -4.62 | 4.697 | 5.297 |
| -4.610000000000115 | -4.61 | 4.687 | 5.289 |
| -4.600000000000115 | -4.6 | 4.677 | 5.282 |
| -4.590000000000115 | -4.59 | 4.668 | 5.274 |
| -4.580000000000115 | -4.58 | 4.658 | 5.267 |
| -4.570000000000115 | -4.57 | 4.648 | 5.259 |
| -4.560000000000116 | -4.56 | 4.639 | 5.251 |
| -4.550000000000116 | -4.55 | 4.629 | 5.244 |
| -4.540000000000116 | -4.54 | 4.619 | 5.236 |
| -4.530000000000116 | -4.53 | 4.61 | 5.229 |
| -4.520000000000117 | -4.52 | 4.6 | 5.221 |
| -4.510000000000117 | -4.51 | 4.59 | 5.214 |
| -4.500000000000117 | -4.5 | 4.581 | 5.206 |
| -4.490000000000117 | -4.49 | 4.571 | 5.199 |
| -4.480000000000117 | -4.48 | 4.562 | 5.191 |
| -4.470000000000117 | -4.47 | 4.552 | 5.184 |
| -4.460000000000118 | -4.46 | 4.542 | 5.177 |
| -4.450000000000118 | -4.45 | 4.533 | 5.169 |
| -4.440000000000118 | -4.44 | 4.523 | 5.162 |
| -4.430000000000118 | -4.43 | 4.513 | 5.154 |
| -4.420000000000119 | -4.42 | 4.504 | 5.147 |
| -4.41000000000012 | -4.41 | 4.494 | 5.14 |
| -4.40000000000012 | -4.4 | 4.484 | 5.132 |
| -4.39000000000012 | -4.39 | 4.475 | 5.125 |
| -4.38000000000012 | -4.38 | 4.465 | 5.118 |
| -4.37000000000012 | -4.37 | 4.456 | 5.11 |
| -4.36000000000012 | -4.36 | 4.446 | 5.103 |
| -4.35000000000012 | -4.35 | 4.436 | 5.096 |
| -4.34000000000012 | -4.34 | 4.427 | 5.088 |
| -4.33000000000012 | -4.33 | 4.417 | 5.081 |
| -4.320000000000121 | -4.32 | 4.408 | 5.074 |
| -4.310000000000121 | -4.31 | 4.398 | 5.067 |
| -4.300000000000121 | -4.3 | 4.388 | 5.059 |
| -4.290000000000121 | -4.29 | 4.379 | 5.052 |
| -4.280000000000121 | -4.28 | 4.369 | 5.045 |
| -4.270000000000122 | -4.27 | 4.36 | 5.038 |
| -4.260000000000122 | -4.26 | 4.35 | 5.031 |
| -4.250000000000122 | -4.25 | 4.34 | 5.023 |
| -4.240000000000122 | -4.24 | 4.331 | 5.016 |
| -4.230000000000122 | -4.23 | 4.321 | 5.009 |
| -4.220000000000123 | -4.22 | 4.312 | 5.002 |
| -4.210000000000123 | -4.21 | 4.302 | 4.995 |
| -4.200000000000123 | -4.2 | 4.292 | 4.988 |
| -4.190000000000124 | -4.19 | 4.283 | 4.981 |
| -4.180000000000124 | -4.18 | 4.273 | 4.974 |
| -4.170000000000124 | -4.17 | 4.264 | 4.967 |
| -4.160000000000124 | -4.16 | 4.254 | 4.96 |
| -4.150000000000124 | -4.15 | 4.245 | 4.953 |
| -4.140000000000124 | -4.14 | 4.235 | 4.946 |
| -4.130000000000125 | -4.13 | 4.225 | 4.939 |
| -4.120000000000125 | -4.12 | 4.216 | 4.932 |
| -4.110000000000125 | -4.11 | 4.206 | 4.925 |
| -4.100000000000125 | -4.1 | 4.197 | 4.918 |
| -4.090000000000125 | -4.09 | 4.187 | 4.911 |
| -4.080000000000126 | -4.08 | 4.178 | 4.904 |
| -4.070000000000126 | -4.07 | 4.168 | 4.897 |
| -4.060000000000126 | -4.06 | 4.159 | 4.89 |
| -4.050000000000126 | -4.05 | 4.149 | 4.883 |
| -4.040000000000127 | -4.04 | 4.14 | 4.876 |
| -4.030000000000127 | -4.03 | 4.13 | 4.869 |
| -4.020000000000127 | -4.02 | 4.121 | 4.862 |
| -4.010000000000127 | -4.01 | 4.111 | 4.856 |
| -4.000000000000127 | -4 | 4.102 | 4.849 |
| -3.990000000000128 | -3.99 | 4.092 | 4.842 |
| -3.980000000000128 | -3.98 | 4.083 | 4.835 |
| -3.970000000000129 | -3.97 | 4.073 | 4.828 |
| -3.960000000000129 | -3.96 | 4.064 | 4.822 |
| -3.950000000000129 | -3.95 | 4.054 | 4.815 |
| -3.940000000000129 | -3.94 | 4.045 | 4.808 |
| -3.930000000000129 | -3.93 | 4.035 | 4.802 |
| -3.92000000000013 | -3.92 | 4.026 | 4.795 |
| -3.91000000000013 | -3.91 | 4.016 | 4.788 |
| -3.90000000000013 | -3.9 | 4.007 | 4.782 |
| -3.89000000000013 | -3.89 | 3.997 | 4.775 |
| -3.88000000000013 | -3.88 | 3.988 | 4.768 |
| -3.870000000000131 | -3.87 | 3.978 | 4.762 |
| -3.860000000000131 | -3.86 | 3.969 | 4.755 |
| -3.850000000000131 | -3.85 | 3.959 | 4.748 |
| -3.840000000000131 | -3.84 | 3.95 | 4.742 |
| -3.830000000000131 | -3.83 | 3.94 | 4.735 |
| -3.820000000000132 | -3.82 | 3.931 | 4.729 |
| -3.810000000000132 | -3.81 | 3.922 | 4.722 |
| -3.800000000000132 | -3.8 | 3.912 | 4.716 |
| -3.790000000000132 | -3.79 | 3.903 | 4.709 |
| -3.780000000000132 | -3.78 | 3.893 | 4.703 |
| -3.770000000000133 | -3.77 | 3.884 | 4.696 |
| -3.760000000000133 | -3.76 | 3.874 | 4.69 |
| -3.750000000000133 | -3.75 | 3.865 | 4.684 |
| -3.740000000000133 | -3.74 | 3.856 | 4.677 |
| -3.730000000000134 | -3.73 | 3.846 | 4.671 |
| -3.720000000000134 | -3.72 | 3.837 | 4.664 |
| -3.710000000000134 | -3.71 | 3.827 | 4.658 |
| -3.700000000000134 | -3.7 | 3.818 | 4.652 |
| -3.690000000000134 | -3.69 | 3.809 | 4.645 |
| -3.680000000000135 | -3.68 | 3.799 | 4.639 |
| -3.670000000000135 | -3.67 | 3.79 | 4.633 |
| -3.660000000000135 | -3.66 | 3.78 | 4.626 |
| -3.650000000000135 | -3.65 | 3.771 | 4.62 |
| -3.640000000000135 | -3.64 | 3.762 | 4.614 |
| -3.630000000000136 | -3.63 | 3.752 | 4.608 |
| -3.620000000000136 | -3.62 | 3.743 | 4.602 |
| -3.610000000000136 | -3.61 | 3.734 | 4.595 |
| -3.600000000000136 | -3.6 | 3.724 | 4.589 |
| -3.590000000000137 | -3.59 | 3.715 | 4.583 |
| -3.580000000000137 | -3.58 | 3.706 | 4.577 |
| -3.570000000000137 | -3.57 | 3.696 | 4.571 |
| -3.560000000000137 | -3.56 | 3.687 | 4.565 |
| -3.550000000000137 | -3.55 | 3.678 | 4.559 |
| -3.540000000000138 | -3.54 | 3.668 | 4.553 |
| -3.530000000000138 | -3.53 | 3.659 | 4.547 |
| -3.520000000000138 | -3.52 | 3.65 | 4.541 |
| -3.510000000000138 | -3.51 | 3.64 | 4.535 |
| -3.500000000000139 | -3.5 | 3.631 | 4.529 |
| -3.490000000000139 | -3.49 | 3.622 | 4.523 |
| -3.480000000000139 | -3.48 | 3.613 | 4.517 |
| -3.470000000000139 | -3.47 | 3.603 | 4.511 |
| -3.460000000000139 | -3.46 | 3.594 | 4.505 |
| -3.45000000000014 | -3.45 | 3.585 | 4.499 |
| -3.44000000000014 | -3.44 | 3.575 | 4.493 |
| -3.43000000000014 | -3.43 | 3.566 | 4.487 |
| -3.42000000000014 | -3.42 | 3.557 | 4.481 |
| -3.41000000000014 | -3.41 | 3.548 | 4.476 |
| -3.400000000000141 | -3.4 | 3.538 | 4.47 |
| -3.390000000000141 | -3.39 | 3.529 | 4.464 |
| -3.380000000000141 | -3.38 | 3.52 | 4.458 |
| -3.370000000000141 | -3.37 | 3.511 | 4.453 |
| -3.360000000000141 | -3.36 | 3.502 | 4.447 |
| -3.350000000000142 | -3.35 | 3.492 | 4.441 |
| -3.340000000000142 | -3.34 | 3.483 | 4.435 |
| -3.330000000000142 | -3.33 | 3.474 | 4.43 |
| -3.320000000000142 | -3.32 | 3.465 | 4.424 |
| -3.310000000000143 | -3.31 | 3.456 | 4.419 |
| -3.300000000000143 | -3.3 | 3.446 | 4.413 |
| -3.290000000000143 | -3.29 | 3.437 | 4.407 |
| -3.280000000000143 | -3.28 | 3.428 | 4.402 |
| -3.270000000000143 | -3.27 | 3.419 | 4.396 |
| -3.260000000000144 | -3.26 | 3.41 | 4.391 |
| -3.250000000000144 | -3.25 | 3.401 | 4.385 |
| -3.240000000000144 | -3.24 | 3.392 | 4.38 |
| -3.230000000000144 | -3.23 | 3.382 | 4.374 |
| -3.220000000000145 | -3.22 | 3.373 | 4.369 |
| -3.210000000000145 | -3.21 | 3.364 | 4.363 |
| -3.200000000000145 | -3.2 | 3.355 | 4.358 |
| -3.190000000000145 | -3.19 | 3.346 | 4.353 |
| -3.180000000000145 | -3.18 | 3.337 | 4.347 |
| -3.170000000000146 | -3.17 | 3.328 | 4.342 |
| -3.160000000000146 | -3.16 | 3.319 | 4.337 |
| -3.150000000000146 | -3.15 | 3.31 | 4.331 |
| -3.140000000000146 | -3.14 | 3.301 | 4.326 |
| -3.130000000000146 | -3.13 | 3.292 | 4.321 |
| -3.120000000000147 | -3.12 | 3.283 | 4.316 |
| -3.110000000000147 | -3.11 | 3.274 | 4.31 |
| -3.100000000000147 | -3.1 | 3.265 | 4.305 |
| -3.090000000000147 | -3.09 | 3.256 | 4.3 |
| -3.080000000000147 | -3.08 | 3.247 | 4.295 |
| -3.070000000000148 | -3.07 | 3.238 | 4.29 |
| -3.060000000000148 | -3.06 | 3.229 | 4.285 |
| -3.050000000000148 | -3.05 | 3.22 | 4.279 |
| -3.040000000000148 | -3.04 | 3.211 | 4.274 |
| -3.030000000000149 | -3.03 | 3.202 | 4.269 |
| -3.020000000000149 | -3.02 | 3.193 | 4.264 |
| -3.010000000000149 | -3.01 | 3.184 | 4.259 |
| -3.000000000000149 | -3 | 3.175 | 4.254 |
| -2.990000000000149 | -2.99 | 3.166 | 4.249 |
| -2.98000000000015 | -2.98 | 3.157 | 4.244 |
| -2.97000000000015 | -2.97 | 3.148 | 4.24 |
| -2.96000000000015 | -2.96 | 3.139 | 4.235 |
| -2.95000000000015 | -2.95 | 3.13 | 4.23 |
| -2.94000000000015 | -2.94 | 3.121 | 4.225 |
| -2.930000000000151 | -2.93 | 3.113 | 4.22 |
| -2.920000000000151 | -2.92 | 3.104 | 4.215 |
| -2.910000000000151 | -2.91 | 3.095 | 4.21 |
| -2.900000000000151 | -2.9 | 3.086 | 4.206 |
| -2.890000000000151 | -2.89 | 3.077 | 4.201 |
| -2.880000000000152 | -2.88 | 3.068 | 4.196 |
| -2.870000000000152 | -2.87 | 3.06 | 4.192 |
| -2.860000000000152 | -2.86 | 3.051 | 4.187 |
| -2.850000000000152 | -2.85 | 3.042 | 4.182 |
| -2.840000000000153 | -2.84 | 3.033 | 4.178 |
| -2.830000000000153 | -2.83 | 3.024 | 4.173 |
| -2.820000000000153 | -2.82 | 3.016 | 4.168 |
| -2.810000000000153 | -2.81 | 3.007 | 4.164 |
| -2.800000000000153 | -2.8 | 2.998 | 4.159 |
| -2.790000000000154 | -2.79 | 2.99 | 4.155 |
| -2.780000000000154 | -2.78 | 2.981 | 4.15 |
| -2.770000000000154 | -2.77 | 2.972 | 4.146 |
| -2.760000000000154 | -2.76 | 2.963 | 4.141 |
| -2.750000000000154 | -2.75 | 2.955 | 4.137 |
| -2.740000000000155 | -2.74 | 2.946 | 4.132 |
| -2.730000000000155 | -2.73 | 2.937 | 4.128 |
| -2.720000000000155 | -2.72 | 2.929 | 4.124 |
| -2.710000000000155 | -2.71 | 2.92 | 4.119 |
| -2.700000000000156 | -2.7 | 2.912 | 4.115 |
| -2.690000000000156 | -2.69 | 2.903 | 4.111 |
| -2.680000000000156 | -2.68 | 2.894 | 4.106 |
| -2.670000000000156 | -2.67 | 2.886 | 4.102 |
| -2.660000000000156 | -2.66 | 2.877 | 4.098 |
| -2.650000000000157 | -2.65 | 2.869 | 4.094 |
| -2.640000000000157 | -2.64 | 2.86 | 4.09 |
| -2.630000000000157 | -2.63 | 2.852 | 4.085 |
| -2.620000000000157 | -2.62 | 2.843 | 4.081 |
| -2.610000000000157 | -2.61 | 2.835 | 4.077 |
| -2.600000000000158 | -2.6 | 2.826 | 4.073 |
| -2.590000000000158 | -2.59 | 2.818 | 4.069 |
| -2.580000000000158 | -2.58 | 2.809 | 4.065 |
| -2.570000000000158 | -2.57 | 2.801 | 4.061 |
| -2.560000000000159 | -2.56 | 2.793 | 4.057 |
| -2.550000000000159 | -2.55 | 2.784 | 4.053 |
| -2.54000000000016 | -2.54 | 2.776 | 4.049 |
| -2.530000000000159 | -2.53 | 2.767 | 4.045 |
| -2.520000000000159 | -2.52 | 2.759 | 4.041 |
| -2.51000000000016 | -2.51 | 2.751 | 4.037 |
| -2.50000000000016 | -2.5 | 2.742 | 4.034 |
| -2.49000000000016 | -2.49 | 2.734 | 4.03 |
| -2.48000000000016 | -2.48 | 2.726 | 4.026 |
| -2.47000000000016 | -2.47 | 2.718 | 4.022 |
| -2.460000000000161 | -2.46 | 2.709 | 4.018 |
| -2.450000000000161 | -2.45 | 2.701 | 4.015 |
| -2.440000000000161 | -2.44 | 2.693 | 4.011 |
| -2.430000000000161 | -2.43 | 2.685 | 4.007 |
| -2.420000000000162 | -2.42 | 2.676 | 4.004 |
| -2.410000000000162 | -2.41 | 2.668 | 4 |
| -2.400000000000162 | -2.4 | 2.66 | 3.996 |
| -2.390000000000162 | -2.39 | 2.652 | 3.993 |
| -2.380000000000162 | -2.38 | 2.644 | 3.989 |
| -2.370000000000163 | -2.37 | 2.636 | 3.986 |
| -2.360000000000163 | -2.36 | 2.628 | 3.982 |
| -2.350000000000163 | -2.35 | 2.62 | 3.979 |
| -2.340000000000163 | -2.34 | 2.612 | 3.975 |
| -2.330000000000163 | -2.33 | 2.604 | 3.972 |
| -2.320000000000164 | -2.32 | 2.596 | 3.968 |
| -2.310000000000164 | -2.31 | 2.588 | 3.965 |
| -2.300000000000164 | -2.3 | 2.58 | 3.961 |
| -2.290000000000164 | -2.29 | 2.572 | 3.958 |
| -2.280000000000165 | -2.28 | 2.564 | 3.955 |
| -2.270000000000165 | -2.27 | 2.556 | 3.951 |
| -2.260000000000165 | -2.26 | 2.548 | 3.948 |
| -2.250000000000165 | -2.25 | 2.54 | 3.945 |
| -2.240000000000165 | -2.24 | 2.532 | 3.942 |
| -2.230000000000166 | -2.23 | 2.525 | 3.938 |
| -2.220000000000166 | -2.22 | 2.517 | 3.935 |
| -2.210000000000166 | -2.21 | 2.509 | 3.932 |
| -2.200000000000166 | -2.2 | 2.501 | 3.929 |
| -2.190000000000166 | -2.19 | 2.494 | 3.926 |
| -2.180000000000167 | -2.18 | 2.486 | 3.923 |
| -2.170000000000167 | -2.17 | 2.478 | 3.92 |
| -2.160000000000167 | -2.16 | 2.47 | 3.917 |
| -2.150000000000167 | -2.15 | 2.463 | 3.914 |
| -2.140000000000168 | -2.14 | 2.455 | 3.911 |
| -2.130000000000168 | -2.13 | 2.448 | 3.908 |
| -2.120000000000168 | -2.12 | 2.44 | 3.905 |
| -2.110000000000168 | -2.11 | 2.433 | 3.902 |
| -2.100000000000168 | -2.1 | 2.425 | 3.899 |
| -2.090000000000169 | -2.09 | 2.418 | 3.896 |
| -2.080000000000169 | -2.08 | 2.41 | 3.893 |
| -2.070000000000169 | -2.07 | 2.403 | 3.89 |
| -2.060000000000169 | -2.06 | 2.395 | 3.887 |
| -2.050000000000169 | -2.05 | 2.388 | 3.885 |
| -2.04000000000017 | -2.04 | 2.38 | 3.882 |
| -2.03000000000017 | -2.03 | 2.373 | 3.879 |
| -2.02000000000017 | -2.02 | 2.366 | 3.876 |
| -2.01000000000017 | -2.01 | 2.359 | 3.874 |
| -2.000000000000171 | -2 | 2.351 | 3.871 |
| -1.99000000000017 | -1.99 | 2.344 | 3.868 |
| -1.98000000000017 | -1.98 | 2.337 | 3.866 |
| -1.97000000000017 | -1.97 | 2.33 | 3.863 |
| -1.96000000000017 | -1.96 | 2.323 | 3.86 |
| -1.95000000000017 | -1.95 | 2.316 | 3.858 |
| -1.94000000000017 | -1.94 | 2.308 | 3.855 |
| -1.93000000000017 | -1.93 | 2.301 | 3.853 |
| -1.92000000000017 | -1.92 | 2.294 | 3.85 |
| -1.91000000000017 | -1.91 | 2.287 | 3.848 |
| -1.90000000000017 | -1.9 | 2.28 | 3.845 |
| -1.89000000000017 | -1.89 | 2.273 | 3.843 |
| -1.88000000000017 | -1.88 | 2.267 | 3.84 |
| -1.87000000000017 | -1.87 | 2.26 | 3.838 |
| -1.86000000000017 | -1.86 | 2.253 | 3.836 |
| -1.85000000000017 | -1.85 | 2.246 | 3.833 |
| -1.84000000000017 | -1.84 | 2.239 | 3.831 |
| -1.83000000000017 | -1.83 | 2.233 | 3.829 |
| -1.82000000000017 | -1.82 | 2.226 | 3.827 |
| -1.81000000000017 | -1.81 | 2.219 | 3.824 |
| -1.80000000000017 | -1.8 | 2.213 | 3.822 |
| -1.79000000000017 | -1.79 | 2.206 | 3.82 |
| -1.78000000000017 | -1.78 | 2.199 | 3.818 |
| -1.77000000000017 | -1.77 | 2.193 | 3.815 |
| -1.76000000000017 | -1.76 | 2.186 | 3.813 |
| -1.75000000000017 | -1.75 | 2.18 | 3.811 |
| -1.74000000000017 | -1.74 | 2.174 | 3.809 |
| -1.73000000000017 | -1.73 | 2.167 | 3.807 |
| -1.72000000000017 | -1.72 | 2.161 | 3.805 |
| -1.71000000000017 | -1.71 | 2.154 | 3.803 |
| -1.70000000000017 | -1.7 | 2.148 | 3.801 |
| -1.69000000000017 | -1.69 | 2.142 | 3.799 |
| -1.68000000000017 | -1.68 | 2.136 | 3.797 |
| -1.67000000000017 | -1.67 | 2.13 | 3.795 |
| -1.66000000000017 | -1.66 | 2.123 | 3.793 |
| -1.65000000000017 | -1.65 | 2.117 | 3.791 |
| -1.64000000000017 | -1.64 | 2.111 | 3.789 |
| -1.63000000000017 | -1.63 | 2.105 | 3.787 |
| -1.62000000000017 | -1.62 | 2.099 | 3.786 |
| -1.61000000000017 | -1.61 | 2.093 | 3.784 |
| -1.60000000000017 | -1.6 | 2.087 | 3.782 |
| -1.59000000000017 | -1.59 | 2.082 | 3.78 |
| -1.58000000000017 | -1.58 | 2.076 | 3.778 |
| -1.57000000000017 | -1.57 | 2.07 | 3.777 |
| -1.56000000000017 | -1.56 | 2.064 | 3.775 |
| -1.55000000000017 | -1.55 | 2.059 | 3.773 |
| -1.54000000000017 | -1.54 | 2.053 | 3.772 |
| -1.53000000000017 | -1.53 | 2.047 | 3.77 |
| -1.52000000000017 | -1.52 | 2.042 | 3.768 |
| -1.51000000000017 | -1.51 | 2.036 | 3.767 |
| -1.50000000000017 | -1.5 | 2.031 | 3.765 |
| -1.49000000000017 | -1.49 | 2.025 | 3.764 |
| -1.48000000000017 | -1.48 | 2.02 | 3.762 |
| -1.47000000000017 | -1.47 | 2.015 | 3.76 |
| -1.46000000000017 | -1.46 | 2.009 | 3.759 |
| -1.45000000000017 | -1.45 | 2.004 | 3.757 |
| -1.44000000000017 | -1.44 | 1.999 | 3.756 |
| -1.43000000000017 | -1.43 | 1.994 | 3.754 |
| -1.42000000000017 | -1.42 | 1.989 | 3.753 |
| -1.41000000000017 | -1.41 | 1.983 | 3.752 |
| -1.40000000000017 | -1.4 | 1.978 | 3.75 |
| -1.39000000000017 | -1.39 | 1.973 | 3.749 |
| -1.38000000000017 | -1.38 | 1.969 | 3.747 |
| -1.37000000000017 | -1.37 | 1.964 | 3.746 |
| -1.36000000000017 | -1.36 | 1.959 | 3.745 |
| -1.35000000000017 | -1.35 | 1.954 | 3.743 |
| -1.34000000000017 | -1.34 | 1.949 | 3.742 |
| -1.33000000000017 | -1.33 | 1.945 | 3.741 |
| -1.32000000000017 | -1.32 | 1.94 | 3.74 |
| -1.31000000000017 | -1.31 | 1.935 | 3.738 |
| -1.30000000000017 | -1.3 | 1.931 | 3.737 |
| -1.29000000000017 | -1.29 | 1.926 | 3.736 |
| -1.28000000000017 | -1.28 | 1.922 | 3.735 |
| -1.27000000000017 | -1.27 | 1.917 | 3.734 |
| -1.26000000000017 | -1.26 | 1.913 | 3.733 |
| -1.25000000000017 | -1.25 | 1.909 | 3.731 |
| -1.24000000000017 | -1.24 | 1.904 | 3.73 |
| -1.23000000000017 | -1.23 | 1.9 | 3.729 |
| -1.22000000000017 | -1.22 | 1.896 | 3.728 |
| -1.21000000000017 | -1.21 | 1.892 | 3.727 |
| -1.20000000000017 | -1.2 | 1.888 | 3.726 |
| -1.19000000000017 | -1.19 | 1.884 | 3.725 |
| -1.18000000000017 | -1.18 | 1.88 | 3.724 |
| -1.17000000000017 | -1.17 | 1.876 | 3.723 |
| -1.16000000000017 | -1.16 | 1.872 | 3.722 |
| -1.15000000000017 | -1.15 | 1.868 | 3.721 |
| -1.14000000000017 | -1.14 | 1.864 | 3.72 |
| -1.13000000000017 | -1.13 | 1.861 | 3.719 |
| -1.12000000000017 | -1.12 | 1.857 | 3.718 |
| -1.11000000000017 | -1.11 | 1.854 | 3.717 |
| -1.10000000000017 | -1.1 | 1.85 | 3.716 |
| -1.09000000000017 | -1.09 | 1.846 | 3.716 |
| -1.08000000000017 | -1.08 | 1.843 | 3.715 |
| -1.07000000000017 | -1.07 | 1.84 | 3.714 |
| -1.06000000000017 | -1.06 | 1.836 | 3.713 |
| -1.05000000000017 | -1.05 | 1.833 | 3.712 |
| -1.04000000000017 | -1.04 | 1.83 | 3.711 |
| -1.03000000000017 | -1.03 | 1.826 | 3.711 |
| -1.02000000000017 | -1.02 | 1.823 | 3.71 |
| -1.01000000000017 | -1.01 | 1.82 | 3.709 |
| -1.00000000000017 | -1 | 1.817 | 3.708 |
| -0.99000000000017 | -0.99 | 1.814 | 3.708 |
| -0.98000000000017 | -0.98 | 1.811 | 3.707 |
| -0.97000000000017 | -0.97 | 1.808 | 3.706 |
| -0.96000000000017 | -0.96 | 1.805 | 3.706 |
| -0.95000000000017 | -0.95 | 1.803 | 3.705 |
| -0.94000000000017 | -0.94 | 1.8 | 3.704 |
| -0.93000000000017 | -0.93 | 1.797 | 3.704 |
| -0.92000000000017 | -0.92 | 1.794 | 3.703 |
| -0.91000000000017 | -0.91 | 1.792 | 3.702 |
| -0.90000000000017 | -0.9 | 1.789 | 3.702 |
| -0.890000000000169 | -0.89 | 1.787 | 3.701 |
| -0.880000000000169 | -0.88 | 1.784 | 3.701 |
| -0.870000000000169 | -0.87 | 1.782 | 3.7 |
| -0.860000000000169 | -0.86 | 1.78 | 3.7 |
| -0.850000000000169 | -0.85 | 1.777 | 3.699 |
| -0.840000000000169 | -0.84 | 1.775 | 3.699 |
| -0.830000000000169 | -0.83 | 1.773 | 3.698 |
| -0.820000000000169 | -0.82 | 1.771 | 3.698 |
| -0.810000000000169 | -0.81 | 1.769 | 3.697 |
| -0.800000000000169 | -0.8 | 1.766 | 3.697 |
| -0.790000000000169 | -0.79 | 1.764 | 3.696 |
| -0.780000000000169 | -0.78 | 1.762 | 3.696 |
| -0.770000000000169 | -0.77 | 1.761 | 3.695 |
| -0.760000000000169 | -0.76 | 1.759 | 3.695 |
| -0.750000000000169 | -0.75 | 1.757 | 3.694 |
| -0.740000000000169 | -0.74 | 1.755 | 3.694 |
| -0.730000000000169 | -0.73 | 1.753 | 3.694 |
| -0.720000000000169 | -0.72 | 1.752 | 3.693 |
| -0.710000000000169 | -0.71 | 1.75 | 3.693 |
| -0.700000000000169 | -0.7 | 1.748 | 3.692 |
| -0.690000000000169 | -0.69 | 1.747 | 3.692 |
| -0.680000000000169 | -0.68 | 1.745 | 3.692 |
| -0.670000000000169 | -0.67 | 1.744 | 3.691 |
| -0.660000000000169 | -0.66 | 1.742 | 3.691 |
| -0.650000000000169 | -0.65 | 1.741 | 3.691 |
| -0.640000000000169 | -0.64 | 1.739 | 3.69 |
| -0.630000000000169 | -0.63 | 1.738 | 3.69 |
| -0.620000000000169 | -0.62 | 1.737 | 3.69 |
| -0.610000000000169 | -0.61 | 1.735 | 3.69 |
| -0.600000000000169 | -0.6 | 1.734 | 3.689 |
| -0.590000000000169 | -0.59 | 1.733 | 3.689 |
| -0.580000000000169 | -0.58 | 1.732 | 3.689 |
| -0.570000000000169 | -0.57 | 1.731 | 3.689 |
| -0.560000000000169 | -0.56 | 1.73 | 3.688 |
| -0.550000000000169 | -0.55 | 1.729 | 3.688 |
| -0.540000000000169 | -0.54 | 1.728 | 3.688 |
| -0.530000000000169 | -0.53 | 1.727 | 3.688 |
| -0.520000000000169 | -0.52 | 1.726 | 3.687 |
| -0.510000000000169 | -0.51 | 1.725 | 3.687 |
| -0.500000000000169 | -0.5 | 1.724 | 3.687 |
| -0.490000000000169 | -0.49 | 1.723 | 3.687 |
| -0.480000000000169 | -0.48 | 1.722 | 3.687 |
| -0.470000000000169 | -0.47 | 1.722 | 3.687 |
| -0.460000000000169 | -0.46 | 1.721 | 3.686 |
| -0.450000000000169 | -0.45 | 1.72 | 3.686 |
| -0.440000000000169 | -0.44 | 1.72 | 3.686 |
| -0.430000000000169 | -0.43 | 1.719 | 3.686 |
| -0.420000000000169 | -0.42 | 1.718 | 3.686 |
| -0.410000000000169 | -0.41 | 1.718 | 3.686 |
| -0.400000000000169 | -0.4 | 1.717 | 3.686 |
| -0.390000000000169 | -0.39 | 1.717 | 3.685 |
| -0.380000000000169 | -0.38 | 1.716 | 3.685 |
| -0.370000000000169 | -0.37 | 1.716 | 3.685 |
| -0.360000000000169 | -0.36 | 1.715 | 3.685 |
| -0.350000000000169 | -0.35 | 1.715 | 3.685 |
| -0.340000000000169 | -0.34 | 1.714 | 3.685 |
| -0.330000000000169 | -0.33 | 1.714 | 3.685 |
| -0.320000000000169 | -0.32 | 1.714 | 3.685 |
| -0.310000000000169 | -0.31 | 1.713 | 3.685 |
| -0.300000000000169 | -0.3 | 1.713 | 3.685 |
| -0.290000000000169 | -0.29 | 1.713 | 3.685 |
| -0.280000000000169 | -0.28 | 1.712 | 3.685 |
| -0.270000000000169 | -0.27 | 1.712 | 3.685 |
| -0.260000000000169 | -0.26 | 1.712 | 3.684 |
| -0.250000000000169 | -0.25 | 1.712 | 3.684 |
| -0.240000000000169 | -0.24 | 1.712 | 3.684 |
| -0.230000000000169 | -0.23 | 1.711 | 3.684 |
| -0.220000000000169 | -0.22 | 1.711 | 3.684 |
| -0.210000000000169 | -0.21 | 1.711 | 3.684 |
| -0.200000000000169 | -0.2 | 1.711 | 3.684 |
| -0.190000000000169 | -0.19 | 1.711 | 3.684 |
| -0.180000000000169 | -0.18 | 1.711 | 3.684 |
| -0.170000000000169 | -0.17 | 1.711 | 3.684 |
| -0.160000000000169 | -0.16 | 1.71 | 3.684 |
| -0.150000000000169 | -0.15 | 1.71 | 3.684 |
| -0.140000000000169 | -0.14 | 1.71 | 3.684 |
| -0.130000000000169 | -0.13 | 1.71 | 3.684 |
| -0.120000000000169 | -0.12 | 1.71 | 3.684 |
| -0.110000000000169 | -0.11 | 1.71 | 3.684 |
| -0.100000000000169 | -0.1 | 1.71 | 3.684 |
| -0.0900000000001689 | -0.09 | 1.71 | 3.684 |
| -0.0800000000001689 | -0.08 | 1.71 | 3.684 |
| -0.0700000000001689 | -0.07 | 1.71 | 3.684 |
| -0.0600000000001689 | -0.06 | 1.71 | 3.684 |
| -0.0500000000001689 | -0.05 | 1.71 | 3.684 |
| -0.0400000000001689 | -0.04 | 1.71 | 3.684 |
| -0.0300000000001689 | -0.03 | 1.71 | 3.684 |
| -0.0200000000001689 | -0.02 | 1.71 | 3.684 |
| -0.0100000000001689 | -0.01 | 1.71 | 3.684 |
| -1.6888920817415e-13 | 0 | 1.71 | 3.684 |
| 0.00999999999983111 | 0.01 | 1.71 | 3.684 |
| 0.0199999999998311 | 0.02 | 1.71 | 3.684 |
| 0.0299999999998311 | 0.03 | 1.71 | 3.684 |
| 0.0399999999998311 | 0.04 | 1.71 | 3.684 |
| 0.0499999999998311 | 0.05 | 1.71 | 3.684 |
| 0.0599999999998311 | 0.06 | 1.71 | 3.684 |
| 0.0699999999998311 | 0.07 | 1.71 | 3.684 |
| 0.0799999999998311 | 0.08 | 1.71 | 3.684 |
| 0.0899999999998311 | 0.09 | 1.71 | 3.684 |
| 0.0999999999998311 | 0.1 | 1.71 | 3.684 |
| 0.109999999999831 | 0.11 | 1.71 | 3.684 |
| 0.119999999999831 | 0.12 | 1.71 | 3.684 |
| 0.129999999999831 | 0.13 | 1.71 | 3.684 |
| 0.139999999999831 | 0.14 | 1.71 | 3.684 |
| 0.149999999999831 | 0.15 | 1.71 | 3.684 |
| 0.159999999999831 | 0.16 | 1.71 | 3.684 |
| 0.169999999999831 | 0.17 | 1.709 | 3.684 |
| 0.179999999999831 | 0.18 | 1.709 | 3.684 |
| 0.189999999999831 | 0.19 | 1.709 | 3.684 |
| 0.199999999999831 | 0.2 | 1.709 | 3.684 |
| 0.209999999999831 | 0.21 | 1.709 | 3.684 |
| 0.219999999999831 | 0.22 | 1.709 | 3.684 |
| 0.229999999999831 | 0.23 | 1.709 | 3.684 |
| 0.239999999999831 | 0.24 | 1.708 | 3.684 |
| 0.249999999999831 | 0.25 | 1.708 | 3.684 |
| 0.259999999999831 | 0.26 | 1.708 | 3.684 |
| 0.269999999999831 | 0.27 | 1.708 | 3.684 |
| 0.279999999999831 | 0.28 | 1.707 | 3.683 |
| 0.289999999999831 | 0.29 | 1.707 | 3.683 |
| 0.299999999999831 | 0.3 | 1.707 | 3.683 |
| 0.309999999999831 | 0.31 | 1.707 | 3.683 |
| 0.319999999999831 | 0.32 | 1.706 | 3.683 |
| 0.329999999999831 | 0.33 | 1.706 | 3.683 |
| 0.339999999999831 | 0.34 | 1.705 | 3.683 |
| 0.349999999999831 | 0.35 | 1.705 | 3.683 |
| 0.359999999999831 | 0.36 | 1.705 | 3.683 |
| 0.369999999999831 | 0.37 | 1.704 | 3.683 |
| 0.379999999999831 | 0.38 | 1.704 | 3.683 |
| 0.389999999999831 | 0.39 | 1.703 | 3.683 |
| 0.399999999999831 | 0.4 | 1.703 | 3.682 |
| 0.409999999999831 | 0.41 | 1.702 | 3.682 |
| 0.419999999999831 | 0.42 | 1.701 | 3.682 |
| 0.429999999999831 | 0.43 | 1.701 | 3.682 |
| 0.439999999999831 | 0.44 | 1.7 | 3.682 |
| 0.449999999999831 | 0.45 | 1.7 | 3.682 |
| 0.459999999999831 | 0.46 | 1.699 | 3.682 |
| 0.469999999999831 | 0.47 | 1.698 | 3.681 |
| 0.479999999999831 | 0.48 | 1.697 | 3.681 |
| 0.489999999999831 | 0.49 | 1.696 | 3.681 |
| 0.499999999999831 | 0.5 | 1.696 | 3.681 |
| 0.509999999999831 | 0.51 | 1.695 | 3.681 |
| 0.519999999999831 | 0.52 | 1.694 | 3.681 |
| 0.529999999999831 | 0.53 | 1.693 | 3.68 |
| 0.539999999999831 | 0.54 | 1.692 | 3.68 |
| 0.549999999999831 | 0.55 | 1.691 | 3.68 |
| 0.559999999999831 | 0.56 | 1.69 | 3.68 |
| 0.569999999999831 | 0.57 | 1.689 | 3.679 |
| 0.579999999999831 | 0.58 | 1.687 | 3.679 |
| 0.589999999999831 | 0.59 | 1.686 | 3.679 |
| 0.599999999999831 | 0.6 | 1.685 | 3.679 |
| 0.609999999999831 | 0.61 | 1.684 | 3.678 |
| 0.619999999999831 | 0.62 | 1.682 | 3.678 |
| 0.629999999999831 | 0.63 | 1.681 | 3.678 |
| 0.639999999999831 | 0.64 | 1.68 | 3.678 |
| 0.649999999999831 | 0.65 | 1.678 | 3.677 |
| 0.659999999999831 | 0.66 | 1.677 | 3.677 |
| 0.669999999999831 | 0.67 | 1.675 | 3.677 |
| 0.679999999999831 | 0.68 | 1.673 | 3.676 |
| 0.689999999999831 | 0.69 | 1.672 | 3.676 |
| 0.699999999999831 | 0.7 | 1.67 | 3.676 |
| 0.709999999999831 | 0.71 | 1.668 | 3.675 |
| 0.719999999999831 | 0.72 | 1.666 | 3.675 |
| 0.729999999999831 | 0.73 | 1.664 | 3.674 |
| 0.739999999999831 | 0.74 | 1.662 | 3.674 |
| 0.749999999999832 | 0.75 | 1.66 | 3.674 |
| 0.759999999999832 | 0.76 | 1.658 | 3.673 |
| 0.769999999999832 | 0.77 | 1.656 | 3.673 |
| 0.779999999999832 | 0.78 | 1.654 | 3.672 |
| 0.789999999999832 | 0.79 | 1.652 | 3.672 |
| 0.799999999999832 | 0.8 | 1.649 | 3.671 |
| 0.809999999999832 | 0.81 | 1.647 | 3.671 |
| 0.819999999999832 | 0.82 | 1.645 | 3.67 |
| 0.829999999999832 | 0.83 | 1.642 | 3.67 |
| 0.839999999999832 | 0.84 | 1.64 | 3.669 |
| 0.849999999999832 | 0.85 | 1.637 | 3.669 |
| 0.859999999999832 | 0.86 | 1.634 | 3.668 |
| 0.869999999999832 | 0.87 | 1.631 | 3.668 |
| 0.879999999999832 | 0.88 | 1.628 | 3.667 |
| 0.889999999999832 | 0.89 | 1.626 | 3.667 |
| 0.899999999999832 | 0.9 | 1.622 | 3.666 |
| 0.909999999999832 | 0.91 | 1.619 | 3.665 |
| 0.919999999999832 | 0.92 | 1.616 | 3.665 |
| 0.929999999999832 | 0.93 | 1.613 | 3.664 |
| 0.939999999999832 | 0.94 | 1.61 | 3.664 |
| 0.949999999999832 | 0.95 | 1.606 | 3.663 |
| 0.959999999999832 | 0.96 | 1.603 | 3.662 |
| 0.969999999999832 | 0.97 | 1.599 | 3.661 |
| 0.979999999999832 | 0.98 | 1.595 | 3.661 |
| 0.989999999999832 | 0.99 | 1.591 | 3.66 |
| 0.999999999999832 | 1 | 1.587 | 3.659 |
| 1.009999999999832 | 1.01 | 1.583 | 3.659 |
| 1.019999999999832 | 1.02 | 1.579 | 3.658 |
| 1.029999999999832 | 1.03 | 1.575 | 3.657 |
| 1.039999999999832 | 1.04 | 1.571 | 3.656 |
| 1.049999999999832 | 1.05 | 1.566 | 3.655 |
| 1.059999999999832 | 1.06 | 1.562 | 3.655 |
| 1.069999999999832 | 1.07 | 1.557 | 3.654 |
| 1.079999999999832 | 1.08 | 1.552 | 3.653 |
| 1.089999999999832 | 1.09 | 1.547 | 3.652 |
| 1.099999999999832 | 1.1 | 1.542 | 3.651 |
| 1.109999999999832 | 1.11 | 1.537 | 3.65 |
| 1.119999999999832 | 1.12 | 1.532 | 3.649 |
| 1.129999999999832 | 1.13 | 1.527 | 3.648 |
| 1.139999999999832 | 1.14 | 1.521 | 3.647 |
| 1.149999999999832 | 1.15 | 1.515 | 3.646 |
| 1.159999999999832 | 1.16 | 1.509 | 3.645 |
| 1.169999999999832 | 1.17 | 1.503 | 3.644 |
| 1.179999999999832 | 1.18 | 1.497 | 3.643 |
| 1.189999999999832 | 1.19 | 1.491 | 3.642 |
| 1.199999999999832 | 1.2 | 1.485 | 3.641 |
| 1.209999999999832 | 1.21 | 1.478 | 3.64 |
| 1.219999999999832 | 1.22 | 1.471 | 3.639 |
| 1.229999999999832 | 1.23 | 1.464 | 3.638 |
| 1.239999999999832 | 1.24 | 1.457 | 3.637 |
| 1.249999999999832 | 1.25 | 1.45 | 3.635 |
| 1.259999999999832 | 1.26 | 1.442 | 3.634 |
| 1.269999999999832 | 1.27 | 1.434 | 3.633 |
| 1.279999999999832 | 1.28 | 1.427 | 3.632 |
| 1.289999999999832 | 1.29 | 1.418 | 3.631 |
| 1.299999999999832 | 1.3 | 1.41 | 3.629 |
| 1.309999999999832 | 1.31 | 1.401 | 3.628 |
| 1.319999999999832 | 1.32 | 1.392 | 3.627 |
| 1.329999999999832 | 1.33 | 1.383 | 3.625 |
| 1.339999999999832 | 1.34 | 1.374 | 3.624 |
| 1.349999999999832 | 1.35 | 1.364 | 3.623 |
| 1.359999999999832 | 1.36 | 1.354 | 3.621 |
| 1.369999999999832 | 1.37 | 1.344 | 3.62 |
| 1.379999999999832 | 1.38 | 1.334 | 3.618 |
| 1.389999999999832 | 1.39 | 1.323 | 3.617 |
| 1.399999999999832 | 1.4 | 1.312 | 3.615 |
| 1.409999999999832 | 1.41 | 1.3 | 3.614 |
| 1.419999999999832 | 1.42 | 1.288 | 3.612 |
| 1.429999999999832 | 1.43 | 1.276 | 3.611 |
| 1.439999999999832 | 1.44 | 1.263 | 3.609 |
| 1.449999999999832 | 1.45 | 1.25 | 3.608 |
| 1.459999999999832 | 1.46 | 1.236 | 3.606 |
| 1.469999999999832 | 1.47 | 1.222 | 3.604 |
| 1.479999999999832 | 1.48 | 1.207 | 3.603 |
| 1.489999999999832 | 1.49 | 1.192 | 3.601 |
| 1.499999999999832 | 1.5 | 1.176 | 3.599 |
| 1.509999999999832 | 1.51 | 1.159 | 3.597 |
| 1.519999999999832 | 1.52 | 1.142 | 3.596 |
| 1.529999999999832 | 1.53 | 1.124 | 3.594 |
| 1.539999999999832 | 1.54 | 1.105 | 3.592 |
| 1.549999999999832 | 1.55 | 1.085 | 3.59 |
| 1.559999999999832 | 1.56 | 1.064 | 3.588 |
| 1.569999999999832 | 1.57 | 1.042 | 3.586 |
| 1.579999999999832 | 1.58 | 1.018 | 3.584 |
| 1.589999999999832 | 1.59 | 0.993 | 3.583 |
| 1.599999999999832 | 1.6 | 0.967 | 3.581 |
| 1.609999999999832 | 1.61 | 0.939 | 3.579 |
| 1.619999999999832 | 1.62 | 0.908 | 3.577 |
| 1.629999999999832 | 1.63 | 0.875 | 3.574 |
| 1.639999999999832 | 1.64 | 0.838 | 3.572 |
| 1.649999999999832 | 1.65 | 0.798 | 3.57 |
| 1.659999999999832 | 1.66 | 0.752 | 3.568 |
| 1.669999999999832 | 1.67 | 0.7 | 3.566 |
| 1.679999999999832 | 1.68 | 0.637 | 3.564 |
| 1.689999999999832 | 1.69 | 0.557 | 3.561 |
| 1.699999999999832 | 1.7 | 0.443 | 3.559 |
| 1.709999999999832 | 1.71 | -0.06 | 3.557 |
| 1.719999999999832 | 1.72 | -0.446 | 3.555 |
| 1.729999999999832 | 1.73 | -0.562 | 3.552 |
| 1.739999999999832 | 1.74 | -0.645 | 3.55 |
| 1.749999999999832 | 1.75 | -0.711 | 3.547 |
| 1.759999999999832 | 1.76 | -0.767 | 3.545 |
| 1.769999999999832 | 1.77 | -0.817 | 3.542 |
| 1.779999999999832 | 1.78 | -0.862 | 3.54 |
| 1.789999999999832 | 1.79 | -0.903 | 3.537 |
| 1.799999999999832 | 1.8 | -0.941 | 3.535 |
| 1.809999999999832 | 1.81 | -0.976 | 3.532 |
| 1.819999999999832 | 1.82 | -1.009 | 3.53 |
| 1.829999999999832 | 1.83 | -1.041 | 3.527 |
| 1.839999999999832 | 1.84 | -1.071 | 3.524 |
| 1.849999999999832 | 1.85 | -1.1 | 3.521 |
| 1.859999999999832 | 1.86 | -1.128 | 3.519 |
| 1.869999999999832 | 1.87 | -1.155 | 3.516 |
| 1.879999999999832 | 1.88 | -1.18 | 3.513 |
| 1.889999999999832 | 1.89 | -1.205 | 3.51 |
| 1.899999999999832 | 1.9 | -1.23 | 3.507 |
| 1.909999999999832 | 1.91 | -1.253 | 3.504 |
| 1.919999999999832 | 1.92 | -1.276 | 3.501 |
| 1.929999999999832 | 1.93 | -1.298 | 3.498 |
| 1.939999999999832 | 1.94 | -1.32 | 3.495 |
| 1.949999999999833 | 1.95 | -1.342 | 3.492 |
| 1.959999999999833 | 1.96 | -1.363 | 3.489 |
| 1.969999999999833 | 1.97 | -1.383 | 3.486 |
| 1.979999999999833 | 1.98 | -1.403 | 3.483 |
| 1.989999999999833 | 1.99 | -1.423 | 3.479 |
| 1.999999999999833 | 2 | -1.442 | 3.476 |
| 2.009999999999832 | 2.01 | -1.461 | 3.473 |
| 2.019999999999832 | 2.02 | -1.48 | 3.469 |
| 2.029999999999832 | 2.03 | -1.499 | 3.466 |
| 2.039999999999832 | 2.04 | -1.517 | 3.462 |
| 2.049999999999832 | 2.05 | -1.535 | 3.459 |
| 2.059999999999831 | 2.06 | -1.552 | 3.455 |
| 2.069999999999831 | 2.07 | -1.57 | 3.452 |
| 2.079999999999831 | 2.08 | -1.587 | 3.448 |
| 2.089999999999831 | 2.09 | -1.604 | 3.445 |
| 2.09999999999983 | 2.1 | -1.621 | 3.441 |
| 2.10999999999983 | 2.11 | -1.638 | 3.437 |
| 2.11999999999983 | 2.12 | -1.654 | 3.433 |
| 2.12999999999983 | 2.13 | -1.671 | 3.43 |
| 2.13999999999983 | 2.14 | -1.687 | 3.426 |
| 2.149999999999829 | 2.15 | -1.703 | 3.422 |
| 2.159999999999829 | 2.16 | -1.719 | 3.418 |
| 2.169999999999829 | 2.17 | -1.735 | 3.414 |
| 2.179999999999829 | 2.18 | -1.75 | 3.41 |
| 2.189999999999829 | 2.19 | -1.766 | 3.406 |
| 2.199999999999828 | 2.2 | -1.781 | 3.401 |
| 2.209999999999828 | 2.21 | -1.796 | 3.397 |
| 2.219999999999828 | 2.22 | -1.811 | 3.393 |
| 2.229999999999828 | 2.23 | -1.826 | 3.389 |
| 2.239999999999827 | 2.24 | -1.841 | 3.384 |
| 2.249999999999827 | 2.25 | -1.856 | 3.38 |
| 2.259999999999827 | 2.26 | -1.87 | 3.375 |
| 2.269999999999827 | 2.27 | -1.885 | 3.371 |
| 2.279999999999827 | 2.28 | -1.899 | 3.366 |
| 2.289999999999826 | 2.29 | -1.914 | 3.362 |
| 2.299999999999826 | 2.3 | -1.928 | 3.357 |
| 2.309999999999826 | 2.31 | -1.942 | 3.352 |
| 2.319999999999826 | 2.32 | -1.956 | 3.348 |
| 2.329999999999825 | 2.33 | -1.97 | 3.343 |
| 2.339999999999825 | 2.34 | -1.984 | 3.338 |
| 2.349999999999825 | 2.35 | -1.998 | 3.333 |
| 2.359999999999825 | 2.36 | -2.012 | 3.328 |
| 2.369999999999825 | 2.37 | -2.026 | 3.323 |
| 2.379999999999824 | 2.38 | -2.039 | 3.318 |
| 2.389999999999824 | 2.39 | -2.053 | 3.313 |
| 2.399999999999824 | 2.4 | -2.066 | 3.307 |
| 2.409999999999824 | 2.41 | -2.08 | 3.302 |
| 2.419999999999824 | 2.42 | -2.093 | 3.297 |
| 2.429999999999823 | 2.43 | -2.107 | 3.291 |
| 2.439999999999823 | 2.44 | -2.12 | 3.286 |
| 2.449999999999823 | 2.45 | -2.133 | 3.28 |
| 2.459999999999823 | 2.46 | -2.146 | 3.275 |
| 2.469999999999823 | 2.47 | -2.159 | 3.269 |
| 2.479999999999822 | 2.48 | -2.172 | 3.263 |
| 2.489999999999822 | 2.49 | -2.185 | 3.257 |
| 2.499999999999822 | 2.5 | -2.198 | 3.251 |
| 2.509999999999822 | 2.51 | -2.211 | 3.246 |
| 2.519999999999821 | 2.52 | -2.224 | 3.24 |
| 2.529999999999821 | 2.53 | -2.237 | 3.233 |
| 2.539999999999821 | 2.54 | -2.25 | 3.227 |
| 2.549999999999821 | 2.55 | -2.262 | 3.221 |
| 2.559999999999821 | 2.56 | -2.275 | 3.215 |
| 2.56999999999982 | 2.57 | -2.288 | 3.208 |
| 2.57999999999982 | 2.58 | -2.3 | 3.202 |
| 2.58999999999982 | 2.59 | -2.313 | 3.195 |
| 2.59999999999982 | 2.6 | -2.325 | 3.189 |
| 2.609999999999819 | 2.61 | -2.338 | 3.182 |
| 2.619999999999819 | 2.62 | -2.35 | 3.175 |
| 2.629999999999819 | 2.63 | -2.363 | 3.168 |
| 2.639999999999819 | 2.64 | -2.375 | 3.162 |
| 2.649999999999819 | 2.65 | -2.388 | 3.155 |
| 2.659999999999818 | 2.66 | -2.4 | 3.147 |
| 2.669999999999818 | 2.67 | -2.412 | 3.14 |
| 2.679999999999818 | 2.68 | -2.424 | 3.133 |
| 2.689999999999818 | 2.69 | -2.437 | 3.126 |
| 2.699999999999818 | 2.7 | -2.449 | 3.118 |
| 2.709999999999817 | 2.71 | -2.461 | 3.111 |
| 2.719999999999817 | 2.72 | -2.473 | 3.103 |
| 2.729999999999817 | 2.73 | -2.485 | 3.095 |
| 2.739999999999817 | 2.74 | -2.497 | 3.087 |
| 2.749999999999817 | 2.75 | -2.509 | 3.079 |
| 2.759999999999816 | 2.76 | -2.521 | 3.071 |
| 2.769999999999816 | 2.77 | -2.533 | 3.063 |
| 2.779999999999816 | 2.78 | -2.545 | 3.055 |
| 2.789999999999816 | 2.79 | -2.557 | 3.047 |
| 2.799999999999815 | 2.8 | -2.569 | 3.038 |
| 2.809999999999815 | 2.81 | -2.581 | 3.03 |
| 2.819999999999815 | 2.82 | -2.593 | 3.021 |
| 2.829999999999815 | 2.83 | -2.604 | 3.012 |
| 2.839999999999815 | 2.84 | -2.616 | 3.003 |
| 2.849999999999814 | 2.85 | -2.628 | 2.994 |
| 2.859999999999814 | 2.86 | -2.64 | 2.985 |
| 2.869999999999814 | 2.87 | -2.651 | 2.976 |
| 2.879999999999814 | 2.88 | -2.663 | 2.967 |
| 2.889999999999814 | 2.89 | -2.675 | 2.957 |
| 2.899999999999813 | 2.9 | -2.686 | 2.948 |
| 2.909999999999813 | 2.91 | -2.698 | 2.938 |
| 2.919999999999813 | 2.92 | -2.71 | 2.928 |
| 2.929999999999813 | 2.93 | -2.721 | 2.918 |
| 2.939999999999813 | 2.94 | -2.733 | 2.908 |
| 2.949999999999812 | 2.95 | -2.745 | 2.898 |
| 2.959999999999812 | 2.96 | -2.756 | 2.887 |
| 2.969999999999812 | 2.97 | -2.768 | 2.877 |
| 2.979999999999812 | 2.98 | -2.779 | 2.866 |
| 2.989999999999811 | 2.99 | -2.791 | 2.855 |
| 2.999999999999811 | 3 | -2.802 | 2.844 |
| 3.009999999999811 | 3.01 | -2.813 | 2.833 |
| 3.019999999999811 | 3.02 | -2.825 | 2.821 |
| 3.029999999999811 | 3.03 | -2.836 | 2.81 |
| 3.03999999999981 | 3.04 | -2.848 | 2.798 |
| 3.04999999999981 | 3.05 | -2.859 | 2.786 |
| 3.05999999999981 | 3.06 | -2.871 | 2.774 |
| 3.06999999999981 | 3.07 | -2.882 | 2.762 |
| 3.07999999999981 | 3.08 | -2.893 | 2.749 |
| 3.089999999999809 | 3.09 | -2.905 | 2.737 |
| 3.099999999999809 | 3.1 | -2.916 | 2.724 |
| 3.109999999999809 | 3.11 | -2.927 | 2.711 |
| 3.119999999999809 | 3.12 | -2.938 | 2.698 |
| 3.129999999999808 | 3.13 | -2.95 | 2.684 |
| 3.139999999999808 | 3.14 | -2.961 | 2.67 |
| 3.149999999999808 | 3.15 | -2.972 | 2.656 |
| 3.159999999999808 | 3.16 | -2.983 | 2.642 |
| 3.169999999999808 | 3.17 | -2.995 | 2.628 |
| 3.179999999999807 | 3.18 | -3.006 | 2.613 |
| 3.189999999999807 | 3.19 | -3.017 | 2.598 |
| 3.199999999999807 | 3.2 | -3.028 | 2.583 |
| 3.209999999999807 | 3.21 | -3.039 | 2.567 |
| 3.219999999999807 | 3.22 | -3.05 | 2.552 |
| 3.229999999999806 | 3.23 | -3.062 | 2.536 |
| 3.239999999999806 | 3.24 | -3.073 | 2.519 |
| 3.249999999999806 | 3.25 | -3.084 | 2.502 |
| 3.259999999999806 | 3.26 | -3.095 | 2.485 |
| 3.269999999999805 | 3.27 | -3.106 | 2.468 |
| 3.279999999999805 | 3.28 | -3.117 | 2.45 |
| 3.289999999999805 | 3.29 | -3.128 | 2.432 |
| 3.299999999999805 | 3.3 | -3.139 | 2.414 |
| 3.309999999999805 | 3.31 | -3.15 | 2.395 |
| 3.319999999999804 | 3.32 | -3.161 | 2.376 |
| 3.329999999999804 | 3.33 | -3.172 | 2.356 |
| 3.339999999999804 | 3.34 | -3.183 | 2.336 |
| 3.349999999999804 | 3.35 | -3.194 | 2.315 |
| 3.359999999999804 | 3.36 | -3.205 | 2.294 |
| 3.369999999999803 | 3.37 | -3.216 | 2.272 |
| 3.379999999999803 | 3.38 | -3.227 | 2.25 |
| 3.389999999999803 | 3.39 | -3.238 | 2.227 |
| 3.399999999999803 | 3.4 | -3.249 | 2.203 |
| 3.409999999999802 | 3.41 | -3.26 | 2.179 |
| 3.419999999999802 | 3.42 | -3.271 | 2.154 |
| 3.429999999999802 | 3.43 | -3.282 | 2.129 |
| 3.439999999999802 | 3.44 | -3.293 | 2.102 |
| 3.449999999999802 | 3.45 | -3.304 | 2.075 |
| 3.459999999999801 | 3.46 | -3.315 | 2.047 |
| 3.469999999999801 | 3.47 | -3.326 | 2.018 |
| 3.479999999999801 | 3.48 | -3.337 | 1.988 |
| 3.489999999999801 | 3.49 | -3.347 | 1.957 |
| 3.499999999999801 | 3.5 | -3.358 | 1.924 |
| 3.5099999999998 | 3.51 | -3.369 | 1.89 |
| 3.5199999999998 | 3.52 | -3.38 | 1.855 |
| 3.5299999999998 | 3.53 | -3.391 | 1.818 |
| 3.5399999999998 | 3.54 | -3.402 | 1.78 |
| 3.5499999999998 | 3.55 | -3.412 | 1.739 |
| 3.559999999999799 | 3.56 | -3.423 | 1.696 |
| 3.569999999999799 | 3.57 | -3.434 | 1.651 |
| 3.579999999999799 | 3.58 | -3.445 | 1.603 |
| 3.589999999999799 | 3.59 | -3.456 | 1.551 |
| 3.599999999999798 | 3.6 | -3.467 | 1.495 |
| 3.609999999999798 | 3.61 | -3.477 | 1.435 |
| 3.619999999999798 | 3.62 | -3.488 | 1.368 |
| 3.629999999999798 | 3.63 | -3.499 | 1.294 |
| 3.639999999999798 | 3.64 | -3.51 | 1.21 |
| 3.649999999999797 | 3.65 | -3.52 | 1.111 |
| 3.659999999999797 | 3.66 | -3.531 | 0.991 |
| 3.669999999999797 | 3.67 | -3.542 | 0.829 |
| 3.679999999999797 | 3.68 | -3.553 | 0.547 |
| 3.689999999999796 | 3.69 | -3.563 | -0.624 |
| 3.699999999999796 | 3.7 | -3.574 | -0.868 |
| 3.709999999999796 | 3.71 | -3.585 | -1.021 |
| 3.719999999999796 | 3.72 | -3.595 | -1.139 |
| 3.729999999999796 | 3.73 | -3.606 | -1.238 |
| 3.739999999999795 | 3.74 | -3.617 | -1.323 |
| 3.749999999999795 | 3.75 | -3.628 | -1.398 |
| 3.759999999999795 | 3.76 | -3.638 | -1.467 |
| 3.769999999999795 | 3.77 | -3.649 | -1.53 |
| 3.779999999999795 | 3.78 | -3.66 | -1.589 |
| 3.789999999999794 | 3.79 | -3.67 | -1.644 |
| 3.799999999999794 | 3.8 | -3.681 | -1.695 |
| 3.809999999999794 | 3.81 | -3.692 | -1.744 |
| 3.819999999999794 | 3.82 | -3.702 | -1.791 |
| 3.829999999999794 | 3.83 | -3.713 | -1.835 |
| 3.839999999999793 | 3.84 | -3.723 | -1.878 |
| 3.849999999999793 | 3.85 | -3.734 | -1.919 |
| 3.859999999999793 | 3.86 | -3.745 | -1.959 |
| 3.869999999999793 | 3.87 | -3.755 | -1.997 |
| 3.879999999999792 | 3.88 | -3.766 | -2.034 |
| 3.889999999999792 | 3.89 | -3.777 | -2.07 |
| 3.899999999999792 | 3.9 | -3.787 | -2.104 |
| 3.909999999999792 | 3.91 | -3.798 | -2.138 |
| 3.919999999999792 | 3.92 | -3.808 | -2.171 |
| 3.929999999999791 | 3.93 | -3.819 | -2.203 |
| 3.939999999999791 | 3.94 | -3.83 | -2.235 |
| 3.949999999999791 | 3.95 | -3.84 | -2.266 |
| 3.959999999999791 | 3.96 | -3.851 | -2.296 |
| 3.969999999999791 | 3.97 | -3.861 | -2.325 |
| 3.97999999999979 | 3.98 | -3.872 | -2.354 |
| 3.98999999999979 | 3.99 | -3.882 | -2.382 |
| 3.99999999999979 | 4 | -3.893 | -2.41 |
| 4.00999999999979 | 4.01 | -3.904 | -2.437 |
| 4.01999999999979 | 4.02 | -3.914 | -2.464 |
| 4.02999999999979 | 4.03 | -3.925 | -2.491 |
| 4.03999999999979 | 4.04 | -3.935 | -2.517 |
| 4.04999999999979 | 4.05 | -3.946 | -2.542 |
| 4.05999999999979 | 4.06 | -3.956 | -2.567 |
| 4.069999999999789 | 4.07 | -3.967 | -2.592 |
| 4.079999999999788 | 4.08 | -3.977 | -2.617 |
| 4.089999999999788 | 4.09 | -3.988 | -2.641 |
| 4.099999999999788 | 4.1 | -3.998 | -2.665 |
| 4.109999999999788 | 4.11 | -4.009 | -2.688 |
| 4.119999999999788 | 4.12 | -4.019 | -2.711 |
| 4.129999999999788 | 4.13 | -4.03 | -2.734 |
| 4.139999999999787 | 4.14 | -4.04 | -2.757 |
| 4.149999999999787 | 4.15 | -4.051 | -2.78 |
| 4.159999999999787 | 4.16 | -4.061 | -2.802 |
| 4.169999999999787 | 4.17 | -4.072 | -2.824 |
| 4.179999999999786 | 4.18 | -4.082 | -2.845 |
| 4.189999999999786 | 4.19 | -4.093 | -2.867 |
| 4.199999999999786 | 4.2 | -4.103 | -2.888 |
| 4.209999999999785 | 4.21 | -4.114 | -2.909 |
| 4.219999999999785 | 4.22 | -4.124 | -2.93 |
| 4.229999999999785 | 4.23 | -4.135 | -2.951 |
| 4.239999999999785 | 4.24 | -4.145 | -2.971 |
| 4.249999999999785 | 4.25 | -4.156 | -2.991 |
| 4.259999999999784 | 4.26 | -4.166 | -3.011 |
| 4.269999999999784 | 4.27 | -4.177 | -3.031 |
| 4.279999999999784 | 4.28 | -4.187 | -3.051 |
| 4.289999999999784 | 4.29 | -4.197 | -3.071 |
| 4.299999999999784 | 4.3 | -4.208 | -3.09 |
| 4.309999999999784 | 4.31 | -4.218 | -3.109 |
| 4.319999999999784 | 4.32 | -4.229 | -3.129 |
| 4.329999999999783 | 4.33 | -4.239 | -3.148 |
| 4.339999999999783 | 4.34 | -4.25 | -3.166 |
| 4.349999999999783 | 4.35 | -4.26 | -3.185 |
| 4.359999999999783 | 4.36 | -4.271 | -3.204 |
| 4.369999999999782 | 4.37 | -4.281 | -3.222 |
| 4.379999999999782 | 4.38 | -4.291 | -3.24 |
| 4.389999999999782 | 4.39 | -4.302 | -3.259 |
| 4.399999999999782 | 4.4 | -4.312 | -3.277 |
| 4.409999999999781 | 4.41 | -4.323 | -3.295 |
| 4.419999999999781 | 4.42 | -4.333 | -3.313 |
| 4.429999999999781 | 4.43 | -4.343 | -3.33 |
| 4.43999999999978 | 4.44 | -4.354 | -3.348 |
| 4.44999999999978 | 4.45 | -4.364 | -3.366 |
| 4.45999999999978 | 4.46 | -4.375 | -3.383 |
| 4.46999999999978 | 4.47 | -4.385 | -3.4 |
| 4.47999999999978 | 4.48 | -4.395 | -3.418 |
| 4.48999999999978 | 4.49 | -4.406 | -3.435 |
| 4.49999999999978 | 4.5 | -4.416 | -3.452 |
| 4.50999999999978 | 4.51 | -4.427 | -3.469 |
| 4.51999999999978 | 4.52 | -4.437 | -3.486 |
| 4.52999999999978 | 4.53 | -4.447 | -3.502 |
| 4.539999999999778 | 4.54 | -4.458 | -3.519 |
| 4.549999999999778 | 4.55 | -4.468 | -3.536 |
| 4.559999999999778 | 4.56 | -4.478 | -3.552 |
| 4.569999999999778 | 4.57 | -4.489 | -3.569 |
| 4.579999999999778 | 4.58 | -4.499 | -3.585 |
| 4.589999999999777 | 4.59 | -4.509 | -3.601 |
| 4.599999999999777 | 4.6 | -4.52 | -3.617 |
| 4.609999999999777 | 4.61 | -4.53 | -3.634 |
| 4.619999999999777 | 4.62 | -4.541 | -3.65 |
| 4.629999999999777 | 4.63 | -4.551 | -3.666 |
| 4.639999999999776 | 4.64 | -4.561 | -3.682 |
| 4.649999999999776 | 4.65 | -4.572 | -3.697 |
| 4.659999999999776 | 4.66 | -4.582 | -3.713 |
| 4.669999999999776 | 4.67 | -4.592 | -3.729 |
| 4.679999999999775 | 4.68 | -4.603 | -3.745 |
| 4.689999999999775 | 4.69 | -4.613 | -3.76 |
| 4.699999999999775 | 4.7 | -4.623 | -3.776 |
| 4.709999999999775 | 4.71 | -4.634 | -3.791 |
| 4.719999999999774 | 4.72 | -4.644 | -3.806 |
| 4.729999999999774 | 4.73 | -4.654 | -3.822 |
| 4.739999999999774 | 4.74 | -4.665 | -3.837 |
| 4.749999999999774 | 4.75 | -4.675 | -3.852 |
| 4.759999999999774 | 4.76 | -4.685 | -3.868 |
| 4.769999999999774 | 4.77 | -4.696 | -3.883 |
| 4.779999999999773 | 4.78 | -4.706 | -3.898 |
| 4.789999999999773 | 4.79 | -4.716 | -3.913 |
| 4.799999999999773 | 4.8 | -4.727 | -3.928 |
| 4.809999999999773 | 4.81 | -4.737 | -3.943 |
| 4.819999999999773 | 4.82 | -4.747 | -3.957 |
| 4.829999999999773 | 4.83 | -4.757 | -3.972 |
| 4.839999999999772 | 4.84 | -4.768 | -3.987 |
| 4.849999999999772 | 4.85 | -4.778 | -4.002 |
| 4.859999999999772 | 4.86 | -4.788 | -4.016 |
| 4.869999999999772 | 4.87 | -4.799 | -4.031 |
| 4.879999999999771 | 4.88 | -4.809 | -4.046 |
| 4.889999999999771 | 4.89 | -4.819 | -4.06 |
| 4.899999999999771 | 4.9 | -4.83 | -4.075 |
| 4.90999999999977 | 4.91 | -4.84 | -4.089 |
| 4.91999999999977 | 4.92 | -4.85 | -4.103 |
| 4.92999999999977 | 4.93 | -4.86 | -4.118 |
| 4.93999999999977 | 4.94 | -4.871 | -4.132 |
| 4.94999999999977 | 4.95 | -4.881 | -4.146 |
| 4.95999999999977 | 4.96 | -4.891 | -4.161 |
| 4.96999999999977 | 4.97 | -4.902 | -4.175 |
| 4.97999999999977 | 4.98 | -4.912 | -4.189 |
| 4.98999999999977 | 4.99 | -4.922 | -4.203 |
| 4.99999999999977 | 5 | -4.932 | -4.217 |
| 5.009999999999768 | 5.01 | -4.943 | -4.231 |
| 5.019999999999768 | 5.02 | -4.953 | -4.245 |
| 5.029999999999768 | 5.03 | -4.963 | -4.259 |
| 5.039999999999768 | 5.04 | -4.974 | -4.273 |
| 5.049999999999767 | 5.05 | -4.984 | -4.287 |
| 5.059999999999767 | 5.06 | -4.994 | -4.301 |
| 5.069999999999767 | 5.07 | -5.004 | -4.315 |
| 5.079999999999767 | 5.08 | -5.015 | -4.328 |
| 5.089999999999767 | 5.09 | -5.025 | -4.342 |
| 5.099999999999766 | 5.1 | -5.035 | -4.356 |
| 5.109999999999766 | 5.11 | -5.045 | -4.37 |
| 5.119999999999766 | 5.12 | -5.056 | -4.383 |
| 5.129999999999766 | 5.13 | -5.066 | -4.397 |
| 5.139999999999766 | 5.14 | -5.076 | -4.411 |
| 5.149999999999765 | 5.15 | -5.086 | -4.424 |
| 5.159999999999765 | 5.16 | -5.097 | -4.438 |
| 5.169999999999765 | 5.17 | -5.107 | -4.451 |
| 5.179999999999765 | 5.18 | -5.117 | -4.465 |
| 5.189999999999764 | 5.19 | -5.127 | -4.478 |
| 5.199999999999764 | 5.2 | -5.138 | -4.491 |
| 5.209999999999764 | 5.21 | -5.148 | -4.505 |
| 5.219999999999764 | 5.22 | -5.158 | -4.518 |
| 5.229999999999764 | 5.23 | -5.168 | -4.532 |
| 5.239999999999763 | 5.24 | -5.179 | -4.545 |
| 5.249999999999763 | 5.25 | -5.189 | -4.558 |
| 5.259999999999763 | 5.26 | -5.199 | -4.571 |
| 5.269999999999763 | 5.27 | -5.209 | -4.585 |
| 5.279999999999763 | 5.28 | -5.22 | -4.598 |
| 5.289999999999762 | 5.29 | -5.23 | -4.611 |
| 5.299999999999762 | 5.3 | -5.24 | -4.624 |
| 5.309999999999762 | 5.31 | -5.25 | -4.637 |
| 5.319999999999762 | 5.32 | -5.26 | -4.65 |
| 5.329999999999762 | 5.33 | -5.271 | -4.663 |
| 5.339999999999761 | 5.34 | -5.281 | -4.676 |
| 5.349999999999761 | 5.35 | -5.291 | -4.69 |
| 5.359999999999761 | 5.36 | -5.301 | -4.703 |
| 5.369999999999761 | 5.37 | -5.312 | -4.716 |
| 5.37999999999976 | 5.38 | -5.322 | -4.728 |
| 5.38999999999976 | 5.39 | -5.332 | -4.741 |
| 5.39999999999976 | 5.4 | -5.342 | -4.754 |
| 5.40999999999976 | 5.41 | -5.352 | -4.767 |
| 5.41999999999976 | 5.42 | -5.363 | -4.78 |
| 5.42999999999976 | 5.43 | -5.373 | -4.793 |
| 5.43999999999976 | 5.44 | -5.383 | -4.806 |
| 5.44999999999976 | 5.45 | -5.393 | -4.819 |
| 5.45999999999976 | 5.46 | -5.404 | -4.831 |
| 5.46999999999976 | 5.47 | -5.414 | -4.844 |
| 5.479999999999758 | 5.48 | -5.424 | -4.857 |
| 5.489999999999758 | 5.49 | -5.434 | -4.87 |
| 5.499999999999758 | 5.5 | -5.444 | -4.882 |
| 5.509999999999758 | 5.51 | -5.455 | -4.895 |
| 5.519999999999758 | 5.52 | -5.465 | -4.908 |
| 5.529999999999758 | 5.53 | -5.475 | -4.92 |
| 5.539999999999757 | 5.54 | -5.485 | -4.933 |
| 5.549999999999757 | 5.55 | -5.495 | -4.945 |
| 5.559999999999757 | 5.56 | -5.506 | -4.958 |
| 5.569999999999757 | 5.57 | -5.516 | -4.971 |
| 5.579999999999756 | 5.58 | -5.526 | -4.983 |
| 5.589999999999756 | 5.59 | -5.536 | -4.996 |
| 5.599999999999756 | 5.6 | -5.546 | -5.008 |
| 5.609999999999756 | 5.61 | -5.557 | -5.021 |
| 5.619999999999756 | 5.62 | -5.567 | -5.033 |
| 5.629999999999756 | 5.63 | -5.577 | -5.046 |
| 5.639999999999755 | 5.64 | -5.587 | -5.058 |
| 5.649999999999755 | 5.65 | -5.597 | -5.07 |
| 5.659999999999755 | 5.66 | -5.607 | -5.083 |
| 5.669999999999755 | 5.67 | -5.618 | -5.095 |
| 5.679999999999754 | 5.68 | -5.628 | -5.108 |
| 5.689999999999754 | 5.69 | -5.638 | -5.12 |
| 5.699999999999754 | 5.7 | -5.648 | -5.132 |
| 5.709999999999754 | 5.71 | -5.658 | -5.145 |
| 5.719999999999754 | 5.72 | -5.669 | -5.157 |
| 5.729999999999753 | 5.73 | -5.679 | -5.169 |
| 5.739999999999753 | 5.74 | -5.689 | -5.182 |
| 5.749999999999753 | 5.75 | -5.699 | -5.194 |
| 5.759999999999753 | 5.76 | -5.709 | -5.206 |
| 5.769999999999753 | 5.77 | -5.719 | -5.218 |
| 5.779999999999752 | 5.78 | -5.73 | -5.231 |
| 5.789999999999752 | 5.79 | -5.74 | -5.243 |
| 5.799999999999752 | 5.8 | -5.75 | -5.255 |
| 5.809999999999752 | 5.81 | -5.76 | -5.267 |
| 5.819999999999752 | 5.82 | -5.77 | -5.279 |
| 5.829999999999751 | 5.83 | -5.781 | -5.291 |
| 5.839999999999751 | 5.84 | -5.791 | -5.304 |
| 5.849999999999751 | 5.85 | -5.801 | -5.316 |
| 5.859999999999751 | 5.86 | -5.811 | -5.328 |
| 5.86999999999975 | 5.87 | -5.821 | -5.34 |
| 5.87999999999975 | 5.88 | -5.831 | -5.352 |
| 5.88999999999975 | 5.89 | -5.842 | -5.364 |
| 5.89999999999975 | 5.9 | -5.852 | -5.376 |
| 5.90999999999975 | 5.91 | -5.862 | -5.388 |
| 5.91999999999975 | 5.92 | -5.872 | -5.4 |
| 5.92999999999975 | 5.93 | -5.882 | -5.412 |
| 5.93999999999975 | 5.94 | -5.892 | -5.424 |
| 5.949999999999748 | 5.95 | -5.903 | -5.436 |
| 5.959999999999748 | 5.96 | -5.913 | -5.448 |
| 5.969999999999748 | 5.97 | -5.923 | -5.46 |
| 5.979999999999748 | 5.98 | -5.933 | -5.472 |
| 5.989999999999747 | 5.99 | -5.943 | -5.484 |
| 5.999999999999747 | 6 | -5.953 | -5.496 |
| 6.009999999999747 | 6.01 | -5.963 | -5.508 |
| 6.019999999999747 | 6.02 | -5.974 | -5.52 |
| 6.029999999999747 | 6.03 | -5.984 | -5.532 |
| 6.039999999999746 | 6.04 | -5.994 | -5.543 |
| 6.049999999999746 | 6.05 | -6.004 | -5.555 |
| 6.059999999999746 | 6.06 | -6.014 | -5.567 |
| 6.069999999999746 | 6.07 | -6.024 | -5.579 |
| 6.079999999999746 | 6.08 | -6.035 | -5.591 |
| 6.089999999999745 | 6.09 | -6.045 | -5.603 |
| 6.099999999999745 | 6.1 | -6.055 | -5.614 |
| 6.109999999999745 | 6.11 | -6.065 | -5.626 |
| 6.119999999999745 | 6.12 | -6.075 | -5.638 |
| 6.129999999999745 | 6.13 | -6.085 | -5.65 |
| 6.139999999999744 | 6.14 | -6.095 | -5.662 |
| 6.149999999999744 | 6.15 | -6.106 | -5.673 |
| 6.159999999999744 | 6.16 | -6.116 | -5.685 |
| 6.169999999999744 | 6.17 | -6.126 | -5.697 |
| 6.179999999999744 | 6.18 | -6.136 | -5.709 |
| 6.189999999999744 | 6.19 | -6.146 | -5.72 |
| 6.199999999999743 | 6.2 | -6.156 | -5.732 |
| 6.209999999999743 | 6.21 | -6.166 | -5.744 |
| 6.219999999999743 | 6.22 | -6.177 | -5.755 |
| 6.229999999999743 | 6.23 | -6.187 | -5.767 |
| 6.239999999999742 | 6.24 | -6.197 | -5.779 |
| 6.249999999999742 | 6.25 | -6.207 | -5.79 |
| 6.259999999999742 | 6.26 | -6.217 | -5.802 |
| 6.269999999999742 | 6.27 | -6.227 | -5.814 |
| 6.279999999999741 | 6.28 | -6.237 | -5.825 |
| 6.289999999999741 | 6.29 | -6.248 | -5.837 |
| 6.299999999999741 | 6.3 | -6.258 | -5.848 |
| 6.309999999999741 | 6.31 | -6.268 | -5.86 |
| 6.319999999999741 | 6.32 | -6.278 | -5.872 |
| 6.329999999999741 | 6.33 | -6.288 | -5.883 |
| 6.33999999999974 | 6.34 | -6.298 | -5.895 |
| 6.34999999999974 | 6.35 | -6.308 | -5.906 |
| 6.35999999999974 | 6.36 | -6.319 | -5.918 |
| 6.36999999999974 | 6.37 | -6.329 | -5.929 |
| 6.37999999999974 | 6.38 | -6.339 | -5.941 |
| 6.38999999999974 | 6.39 | -6.349 | -5.953 |
| 6.39999999999974 | 6.4 | -6.359 | -5.964 |
| 6.409999999999738 | 6.41 | -6.369 | -5.976 |
| 6.419999999999738 | 6.42 | -6.379 | -5.987 |
| 6.429999999999738 | 6.43 | -6.389 | -5.999 |
| 6.439999999999738 | 6.44 | -6.4 | -6.01 |
| 6.449999999999738 | 6.45 | -6.41 | -6.022 |
| 6.459999999999737 | 6.46 | -6.42 | -6.033 |
| 6.469999999999737 | 6.47 | -6.43 | -6.044 |
| 6.479999999999737 | 6.48 | -6.44 | -6.056 |
| 6.489999999999737 | 6.49 | -6.45 | -6.067 |
| 6.499999999999737 | 6.5 | -6.46 | -6.079 |
| 6.509999999999736 | 6.51 | -6.47 | -6.09 |
| 6.519999999999736 | 6.52 | -6.481 | -6.102 |
| 6.529999999999736 | 6.53 | -6.491 | -6.113 |
| 6.539999999999736 | 6.54 | -6.501 | -6.124 |
| 6.549999999999736 | 6.55 | -6.511 | -6.136 |
| 6.559999999999735 | 6.56 | -6.521 | -6.147 |
| 6.569999999999735 | 6.57 | -6.531 | -6.159 |
| 6.579999999999735 | 6.58 | -6.541 | -6.17 |
| 6.589999999999735 | 6.59 | -6.551 | -6.181 |
| 6.599999999999734 | 6.6 | -6.562 | -6.193 |
| 6.609999999999734 | 6.61 | -6.572 | -6.204 |
| 6.619999999999734 | 6.62 | -6.582 | -6.215 |
| 6.629999999999734 | 6.63 | -6.592 | -6.227 |
| 6.639999999999734 | 6.64 | -6.602 | -6.238 |
| 6.649999999999734 | 6.65 | -6.612 | -6.249 |
| 6.659999999999734 | 6.66 | -6.622 | -6.261 |
| 6.669999999999733 | 6.67 | -6.632 | -6.272 |
| 6.679999999999733 | 6.68 | -6.642 | -6.283 |
| 6.689999999999733 | 6.69 | -6.653 | -6.295 |
| 6.699999999999733 | 6.7 | -6.663 | -6.306 |
| 6.709999999999732 | 6.71 | -6.673 | -6.317 |
| 6.719999999999732 | 6.72 | -6.683 | -6.329 |
| 6.729999999999732 | 6.73 | -6.693 | -6.34 |
| 6.739999999999731 | 6.74 | -6.703 | -6.351 |
| 6.749999999999731 | 6.75 | -6.713 | -6.362 |
| 6.759999999999731 | 6.76 | -6.723 | -6.374 |
| 6.769999999999731 | 6.77 | -6.733 | -6.385 |
| 6.77999999999973 | 6.78 | -6.744 | -6.396 |
| 6.78999999999973 | 6.79 | -6.754 | -6.407 |
| 6.79999999999973 | 6.8 | -6.764 | -6.419 |
| 6.80999999999973 | 6.81 | -6.774 | -6.43 |
| 6.81999999999973 | 6.82 | -6.784 | -6.441 |
| 6.82999999999973 | 6.83 | -6.794 | -6.452 |
| 6.83999999999973 | 6.84 | -6.804 | -6.463 |
| 6.84999999999973 | 6.85 | -6.814 | -6.475 |
| 6.85999999999973 | 6.86 | -6.824 | -6.486 |
| 6.86999999999973 | 6.87 | -6.835 | -6.497 |
| 6.879999999999728 | 6.88 | -6.845 | -6.508 |
| 6.889999999999728 | 6.89 | -6.855 | -6.519 |
| 6.899999999999728 | 6.9 | -6.865 | -6.53 |
| 6.909999999999728 | 6.91 | -6.875 | -6.542 |
| 6.919999999999728 | 6.92 | -6.885 | -6.553 |
| 6.929999999999727 | 6.93 | -6.895 | -6.564 |
| 6.939999999999727 | 6.94 | -6.905 | -6.575 |
| 6.949999999999727 | 6.95 | -6.915 | -6.586 |
| 6.959999999999727 | 6.96 | -6.925 | -6.597 |
| 6.969999999999727 | 6.97 | -6.936 | -6.609 |
| 6.979999999999726 | 6.98 | -6.946 | -6.62 |
| 6.989999999999726 | 6.99 | -6.956 | -6.631 |
| 6.999999999999726 | 7 | -6.966 | -6.642 |
| 7.009999999999726 | 7.01 | -6.976 | -6.653 |
| 7.019999999999726 | 7.02 | -6.986 | -6.664 |
| 7.029999999999725 | 7.03 | -6.996 | -6.675 |
| 7.039999999999725 | 7.04 | -7.006 | -6.686 |
| 7.049999999999725 | 7.05 | -7.016 | -6.697 |
| 7.059999999999725 | 7.06 | -7.026 | -6.708 |
| 7.069999999999724 | 7.07 | -7.036 | -6.719 |
| 7.079999999999724 | 7.08 | -7.047 | -6.731 |
| 7.089999999999724 | 7.09 | -7.057 | -6.742 |
| 7.099999999999724 | 7.1 | -7.067 | -6.753 |
| 7.109999999999724 | 7.11 | -7.077 | -6.764 |
| 7.119999999999724 | 7.12 | -7.087 | -6.775 |
| 7.129999999999724 | 7.13 | -7.097 | -6.786 |
| 7.139999999999723 | 7.14 | -7.107 | -6.797 |
| 7.149999999999723 | 7.15 | -7.117 | -6.808 |
| 7.159999999999723 | 7.16 | -7.127 | -6.819 |
| 7.169999999999723 | 7.17 | -7.137 | -6.83 |
| 7.179999999999722 | 7.18 | -7.148 | -6.841 |
| 7.189999999999722 | 7.19 | -7.158 | -6.852 |
| 7.199999999999722 | 7.2 | -7.168 | -6.863 |
| 7.209999999999721 | 7.21 | -7.178 | -6.874 |
| 7.219999999999721 | 7.22 | -7.188 | -6.885 |
| 7.229999999999721 | 7.23 | -7.198 | -6.896 |
| 7.23999999999972 | 7.24 | -7.208 | -6.907 |
| 7.24999999999972 | 7.25 | -7.218 | -6.918 |
| 7.25999999999972 | 7.26 | -7.228 | -6.929 |
| 7.26999999999972 | 7.27 | -7.238 | -6.94 |
| 7.27999999999972 | 7.28 | -7.248 | -6.951 |
| 7.28999999999972 | 7.29 | -7.259 | -6.962 |
| 7.29999999999972 | 7.3 | -7.269 | -6.973 |
| 7.30999999999972 | 7.31 | -7.279 | -6.984 |
| 7.31999999999972 | 7.32 | -7.289 | -6.995 |
| 7.329999999999719 | 7.33 | -7.299 | -7.006 |
| 7.33999999999972 | 7.34 | -7.309 | -7.017 |
| 7.349999999999719 | 7.35 | -7.319 | -7.028 |
| 7.359999999999719 | 7.36 | -7.329 | -7.038 |
| 7.369999999999718 | 7.37 | -7.339 | -7.049 |
| 7.379999999999718 | 7.38 | -7.349 | -7.06 |
| 7.389999999999718 | 7.39 | -7.359 | -7.071 |
| 7.399999999999718 | 7.4 | -7.369 | -7.082 |
| 7.409999999999717 | 7.41 | -7.38 | -7.093 |
| 7.419999999999717 | 7.42 | -7.39 | -7.104 |
| 7.429999999999717 | 7.43 | -7.4 | -7.115 |
| 7.439999999999717 | 7.44 | -7.41 | -7.126 |
| 7.449999999999716 | 7.45 | -7.42 | -7.137 |
| 7.459999999999716 | 7.46 | -7.43 | -7.148 |
| 7.469999999999716 | 7.47 | -7.44 | -7.159 |
| 7.479999999999716 | 7.48 | -7.45 | -7.169 |
| 7.489999999999715 | 7.49 | -7.46 | -7.18 |
| 7.499999999999715 | 7.5 | -7.47 | -7.191 |
| 7.509999999999715 | 7.51 | -7.48 | -7.202 |
| 7.519999999999715 | 7.52 | -7.49 | -7.213 |
| 7.529999999999715 | 7.53 | -7.5 | -7.224 |
| 7.539999999999714 | 7.54 | -7.511 | -7.235 |
| 7.549999999999714 | 7.55 | -7.521 | -7.245 |
| 7.559999999999714 | 7.56 | -7.531 | -7.256 |
| 7.569999999999714 | 7.57 | -7.541 | -7.267 |
| 7.579999999999714 | 7.58 | -7.551 | -7.278 |
| 7.589999999999714 | 7.59 | -7.561 | -7.289 |
| 7.599999999999714 | 7.6 | -7.571 | -7.3 |
| 7.609999999999713 | 7.61 | -7.581 | -7.311 |
| 7.619999999999713 | 7.62 | -7.591 | -7.321 |
| 7.629999999999713 | 7.63 | -7.601 | -7.332 |
| 7.639999999999713 | 7.64 | -7.611 | -7.343 |
| 7.649999999999712 | 7.65 | -7.621 | -7.354 |
| 7.659999999999712 | 7.66 | -7.631 | -7.365 |
| 7.669999999999712 | 7.67 | -7.642 | -7.376 |
| 7.679999999999712 | 7.68 | -7.652 | -7.386 |
| 7.689999999999712 | 7.69 | -7.662 | -7.397 |
| 7.699999999999711 | 7.7 | -7.672 | -7.408 |
| 7.709999999999711 | 7.71 | -7.682 | -7.419 |
| 7.719999999999711 | 7.72 | -7.692 | -7.43 |
| 7.729999999999711 | 7.73 | -7.702 | -7.44 |
| 7.73999999999971 | 7.74 | -7.712 | -7.451 |
| 7.74999999999971 | 7.75 | -7.722 | -7.462 |
| 7.75999999999971 | 7.76 | -7.732 | -7.473 |
| 7.76999999999971 | 7.77 | -7.742 | -7.484 |
| 7.77999999999971 | 7.78 | -7.752 | -7.494 |
| 7.78999999999971 | 7.79 | -7.762 | -7.505 |
| 7.79999999999971 | 7.8 | -7.773 | -7.516 |
| 7.80999999999971 | 7.81 | -7.783 | -7.527 |
| 7.819999999999709 | 7.82 | -7.793 | -7.537 |
| 7.829999999999709 | 7.83 | -7.803 | -7.548 |
| 7.839999999999708 | 7.84 | -7.813 | -7.559 |
| 7.849999999999708 | 7.85 | -7.823 | -7.57 |
| 7.859999999999708 | 7.86 | -7.833 | -7.58 |
| 7.869999999999708 | 7.87 | -7.843 | -7.591 |
| 7.879999999999707 | 7.88 | -7.853 | -7.602 |
| 7.889999999999707 | 7.89 | -7.863 | -7.613 |
| 7.899999999999707 | 7.9 | -7.873 | -7.623 |
| 7.909999999999707 | 7.91 | -7.883 | -7.634 |
| 7.919999999999706 | 7.92 | -7.893 | -7.645 |
| 7.929999999999706 | 7.93 | -7.903 | -7.656 |
| 7.939999999999706 | 7.94 | -7.913 | -7.666 |
| 7.949999999999706 | 7.95 | -7.924 | -7.677 |
| 7.959999999999705 | 7.96 | -7.934 | -7.688 |
| 7.969999999999705 | 7.97 | -7.944 | -7.698 |
| 7.979999999999705 | 7.98 | -7.954 | -7.709 |
| 7.989999999999705 | 7.99 | -7.964 | -7.72 |
| 7.999999999999705 | 8 | -7.974 | -7.731 |
| 8.009999999999703 | 8.01 | -7.984 | -7.741 |
| 8.019999999999705 | 8.02 | -7.994 | -7.752 |
| 8.029999999999704 | 8.03 | -8.004 | -7.763 |
| 8.039999999999704 | 8.04 | -8.014 | -7.773 |
| 8.049999999999704 | 8.05 | -8.024 | -7.784 |
| 8.059999999999704 | 8.06 | -8.034 | -7.795 |
| 8.069999999999704 | 8.07 | -8.044 | -7.806 |
| 8.079999999999703 | 8.08 | -8.054 | -7.816 |
| 8.089999999999703 | 8.09 | -8.064 | -7.827 |
| 8.099999999999701 | 8.1 | -8.075 | -7.838 |
| 8.109999999999703 | 8.11 | -8.085 | -7.848 |
| 8.119999999999703 | 8.12 | -8.095 | -7.859 |
| 8.129999999999702 | 8.13 | -8.105 | -7.87 |
| 8.139999999999702 | 8.14 | -8.115 | -7.88 |
| 8.1499999999997 | 8.15 | -8.125 | -7.891 |
| 8.1599999999997 | 8.16 | -8.135 | -7.902 |
| 8.1699999999997 | 8.17 | -8.145 | -7.912 |
| 8.1799999999997 | 8.18 | -8.155 | -7.923 |
| 8.1899999999997 | 8.19 | -8.165 | -7.934 |
| 8.1999999999997 | 8.2 | -8.175 | -7.944 |
| 8.2099999999997 | 8.21 | -8.185 | -7.955 |
| 8.2199999999997 | 8.22 | -8.195 | -7.966 |
| 8.2299999999997 | 8.23 | -8.205 | -7.976 |
| 8.2399999999997 | 8.24 | -8.215 | -7.987 |
| 8.2499999999997 | 8.25 | -8.225 | -7.997 |
| 8.2599999999997 | 8.26 | -8.235 | -8.008 |
| 8.2699999999997 | 8.27 | -8.246 | -8.019 |
| 8.2799999999997 | 8.28 | -8.256 | -8.029 |
| 8.289999999999697 | 8.29 | -8.266 | -8.04 |
| 8.299999999999699 | 8.3 | -8.276 | -8.051 |
| 8.309999999999699 | 8.31 | -8.286 | -8.061 |
| 8.319999999999698 | 8.32 | -8.296 | -8.072 |
| 8.329999999999698 | 8.33 | -8.306 | -8.083 |
| 8.339999999999698 | 8.34 | -8.316 | -8.093 |
| 8.349999999999698 | 8.35 | -8.326 | -8.104 |
| 8.359999999999697 | 8.36 | -8.336 | -8.114 |
| 8.369999999999697 | 8.37 | -8.346 | -8.125 |
| 8.379999999999695 | 8.38 | -8.356 | -8.136 |
| 8.389999999999697 | 8.39 | -8.366 | -8.146 |
| 8.399999999999697 | 8.4 | -8.376 | -8.157 |
| 8.409999999999696 | 8.41 | -8.386 | -8.167 |
| 8.419999999999696 | 8.42 | -8.396 | -8.178 |
| 8.429999999999694 | 8.43 | -8.406 | -8.189 |
| 8.439999999999696 | 8.44 | -8.417 | -8.199 |
| 8.449999999999696 | 8.45 | -8.427 | -8.21 |
| 8.459999999999695 | 8.46 | -8.437 | -8.22 |
| 8.469999999999695 | 8.47 | -8.447 | -8.231 |
| 8.479999999999693 | 8.48 | -8.457 | -8.242 |
| 8.489999999999695 | 8.49 | -8.467 | -8.252 |
| 8.499999999999694 | 8.5 | -8.477 | -8.263 |
| 8.509999999999694 | 8.51 | -8.487 | -8.273 |
| 8.519999999999694 | 8.52 | -8.497 | -8.284 |
| 8.529999999999694 | 8.53 | -8.507 | -8.294 |
| 8.539999999999694 | 8.54 | -8.517 | -8.305 |
| 8.549999999999693 | 8.55 | -8.527 | -8.316 |
| 8.55999999999969 | 8.56 | -8.537 | -8.326 |
| 8.56999999999969 | 8.57 | -8.547 | -8.337 |
| 8.57999999999969 | 8.58 | -8.557 | -8.347 |
| 8.58999999999969 | 8.59 | -8.567 | -8.358 |
| 8.59999999999969 | 8.6 | -8.577 | -8.368 |
| 8.60999999999969 | 8.61 | -8.587 | -8.379 |
| 8.61999999999969 | 8.62 | -8.598 | -8.39 |
| 8.62999999999969 | 8.63 | -8.608 | -8.4 |
| 8.63999999999969 | 8.64 | -8.618 | -8.411 |
| 8.64999999999969 | 8.65 | -8.628 | -8.421 |
| 8.65999999999969 | 8.66 | -8.638 | -8.432 |
| 8.66999999999969 | 8.67 | -8.648 | -8.442 |
| 8.67999999999969 | 8.68 | -8.658 | -8.453 |
| 8.68999999999969 | 8.69 | -8.668 | -8.463 |
| 8.69999999999969 | 8.7 | -8.678 | -8.474 |
| 8.70999999999969 | 8.71 | -8.688 | -8.485 |
| 8.71999999999969 | 8.72 | -8.698 | -8.495 |
| 8.72999999999969 | 8.73 | -8.708 | -8.506 |
| 8.73999999999969 | 8.74 | -8.718 | -8.516 |
| 8.74999999999969 | 8.75 | -8.728 | -8.527 |
| 8.759999999999687 | 8.76 | -8.738 | -8.537 |
| 8.769999999999689 | 8.77 | -8.748 | -8.548 |
| 8.779999999999688 | 8.78 | -8.758 | -8.558 |
| 8.789999999999688 | 8.79 | -8.768 | -8.569 |
| 8.799999999999686 | 8.8 | -8.778 | -8.579 |
| 8.809999999999688 | 8.81 | -8.788 | -8.59 |
| 8.819999999999688 | 8.82 | -8.799 | -8.6 |
| 8.829999999999687 | 8.83 | -8.809 | -8.611 |
| 8.839999999999687 | 8.84 | -8.819 | -8.621 |
| 8.849999999999685 | 8.85 | -8.829 | -8.632 |
| 8.859999999999687 | 8.86 | -8.839 | -8.642 |
| 8.869999999999687 | 8.87 | -8.849 | -8.653 |
| 8.879999999999686 | 8.88 | -8.859 | -8.663 |
| 8.889999999999686 | 8.89 | -8.869 | -8.674 |
| 8.899999999999684 | 8.9 | -8.879 | -8.684 |
| 8.909999999999686 | 8.91 | -8.889 | -8.695 |
| 8.919999999999686 | 8.92 | -8.899 | -8.705 |
| 8.929999999999685 | 8.93 | -8.909 | -8.716 |
| 8.939999999999685 | 8.94 | -8.919 | -8.726 |
| 8.949999999999685 | 8.95 | -8.929 | -8.737 |
| 8.959999999999685 | 8.96 | -8.939 | -8.747 |
| 8.969999999999684 | 8.97 | -8.949 | -8.758 |
| 8.979999999999684 | 8.98 | -8.959 | -8.768 |
| 8.989999999999682 | 8.99 | -8.969 | -8.779 |
| 8.999999999999684 | 9 | -8.979 | -8.789 |
| 9.009999999999684 | 9.01 | -8.989 | -8.8 |
| 9.019999999999683 | 9.02 | -8.999 | -8.81 |
| 9.029999999999683 | 9.03 | -9.01 | -8.821 |
| 9.039999999999681 | 9.04 | -9.02 | -8.831 |
| 9.049999999999683 | 9.05 | -9.03 | -8.842 |
| 9.05999999999968 | 9.06 | -9.04 | -8.852 |
| 9.06999999999968 | 9.07 | -9.05 | -8.863 |
| 9.07999999999968 | 9.08 | -9.06 | -8.873 |
| 9.08999999999968 | 9.09 | -9.07 | -8.884 |
| 9.09999999999968 | 9.1 | -9.08 | -8.894 |
| 9.10999999999968 | 9.11 | -9.09 | -8.905 |
| 9.11999999999968 | 9.12 | -9.1 | -8.915 |
| 9.12999999999968 | 9.13 | -9.11 | -8.926 |
| 9.13999999999968 | 9.14 | -9.12 | -8.936 |
| 9.14999999999968 | 9.15 | -9.13 | -8.946 |
| 9.15999999999968 | 9.16 | -9.14 | -8.957 |
| 9.16999999999968 | 9.17 | -9.15 | -8.967 |
| 9.17999999999968 | 9.18 | -9.16 | -8.978 |
| 9.18999999999968 | 9.19 | -9.17 | -8.988 |
| 9.19999999999968 | 9.2 | -9.18 | -8.999 |
| 9.20999999999968 | 9.21 | -9.19 | -9.009 |
| 9.21999999999968 | 9.22 | -9.2 | -9.02 |
| 9.229999999999677 | 9.23 | -9.21 | -9.03 |
| 9.239999999999679 | 9.24 | -9.22 | -9.041 |
| 9.249999999999678 | 9.25 | -9.23 | -9.051 |
| 9.259999999999678 | 9.26 | -9.241 | -9.061 |
| 9.269999999999678 | 9.27 | -9.251 | -9.072 |
| 9.279999999999678 | 9.28 | -9.261 | -9.082 |
| 9.289999999999678 | 9.29 | -9.271 | -9.093 |
| 9.299999999999677 | 9.3 | -9.281 | -9.103 |
| 9.309999999999677 | 9.31 | -9.291 | -9.114 |
| 9.319999999999675 | 9.32 | -9.301 | -9.124 |
| 9.329999999999677 | 9.33 | -9.311 | -9.134 |
| 9.339999999999677 | 9.34 | -9.321 | -9.145 |
| 9.349999999999676 | 9.35 | -9.331 | -9.155 |
| 9.359999999999676 | 9.36 | -9.341 | -9.166 |
| 9.369999999999674 | 9.37 | -9.351 | -9.176 |
| 9.379999999999676 | 9.38 | -9.361 | -9.187 |
| 9.389999999999675 | 9.39 | -9.371 | -9.197 |
| 9.399999999999675 | 9.4 | -9.381 | -9.207 |
| 9.409999999999675 | 9.41 | -9.391 | -9.218 |
| 9.419999999999675 | 9.42 | -9.401 | -9.228 |
| 9.429999999999675 | 9.43 | -9.411 | -9.239 |
| 9.439999999999674 | 9.44 | -9.421 | -9.249 |
| 9.449999999999674 | 9.45 | -9.431 | -9.26 |
| 9.459999999999672 | 9.46 | -9.441 | -9.27 |
| 9.469999999999674 | 9.47 | -9.451 | -9.28 |
| 9.479999999999674 | 9.48 | -9.461 | -9.291 |
| 9.489999999999673 | 9.49 | -9.471 | -9.301 |
| 9.499999999999673 | 9.5 | -9.481 | -9.312 |
| 9.509999999999671 | 9.51 | -9.492 | -9.322 |
| 9.519999999999673 | 9.52 | -9.502 | -9.332 |
| 9.529999999999673 | 9.53 | -9.512 | -9.343 |
| 9.539999999999672 | 9.54 | -9.522 | -9.353 |
| 9.549999999999672 | 9.55 | -9.532 | -9.364 |
| 9.55999999999967 | 9.56 | -9.542 | -9.374 |
| 9.56999999999967 | 9.57 | -9.552 | -9.384 |
| 9.57999999999967 | 9.58 | -9.562 | -9.395 |
| 9.58999999999967 | 9.59 | -9.572 | -9.405 |
| 9.59999999999967 | 9.6 | -9.582 | -9.416 |
| 9.60999999999967 | 9.61 | -9.592 | -9.426 |
| 9.61999999999967 | 9.62 | -9.602 | -9.436 |
| 9.62999999999967 | 9.63 | -9.612 | -9.447 |
| 9.63999999999967 | 9.64 | -9.622 | -9.457 |
| 9.64999999999967 | 9.65 | -9.632 | -9.468 |
| 9.65999999999967 | 9.66 | -9.642 | -9.478 |
| 9.66999999999967 | 9.67 | -9.652 | -9.488 |
| 9.67999999999967 | 9.68 | -9.662 | -9.499 |
| 9.689999999999667 | 9.69 | -9.672 | -9.509 |
| 9.699999999999669 | 9.7 | -9.682 | -9.52 |
| 9.709999999999669 | 9.71 | -9.692 | -9.53 |
| 9.719999999999668 | 9.72 | -9.702 | -9.54 |
| 9.729999999999668 | 9.73 | -9.712 | -9.551 |
| 9.739999999999666 | 9.74 | -9.722 | -9.561 |
| 9.749999999999668 | 9.75 | -9.732 | -9.571 |
| 9.759999999999668 | 9.76 | -9.742 | -9.582 |
| 9.769999999999667 | 9.77 | -9.753 | -9.592 |
| 9.779999999999667 | 9.78 | -9.763 | -9.603 |
| 9.789999999999665 | 9.79 | -9.773 | -9.613 |
| 9.799999999999667 | 9.8 | -9.783 | -9.623 |
| 9.809999999999667 | 9.81 | -9.793 | -9.634 |
| 9.819999999999666 | 9.82 | -9.803 | -9.644 |
| 9.829999999999666 | 9.83 | -9.813 | -9.654 |
| 9.839999999999664 | 9.84 | -9.823 | -9.665 |
| 9.849999999999666 | 9.85 | -9.833 | -9.675 |
| 9.859999999999665 | 9.86 | -9.843 | -9.685 |
| 9.869999999999665 | 9.87 | -9.853 | -9.696 |
| 9.879999999999663 | 9.88 | -9.863 | -9.706 |
| 9.889999999999665 | 9.89 | -9.873 | -9.717 |
| 9.899999999999665 | 9.9 | -9.883 | -9.727 |
| 9.909999999999664 | 9.91 | -9.893 | -9.737 |
| 9.919999999999664 | 9.92 | -9.903 | -9.748 |
| 9.929999999999662 | 9.93 | -9.913 | -9.758 |
| 9.939999999999664 | 9.94 | -9.923 | -9.768 |
| 9.949999999999664 | 9.95 | -9.933 | -9.779 |
| 9.95999999999966 | 9.96 | -9.943 | -9.789 |
| 9.96999999999966 | 9.97 | -9.953 | -9.799 |
| 9.97999999999966 | 9.98 | -9.963 | -9.81 |
| 9.98999999999966 | 9.99 | -9.973 | -9.82 |
| 9.99999999999966 | 10 | -9.983 | -9.83 |